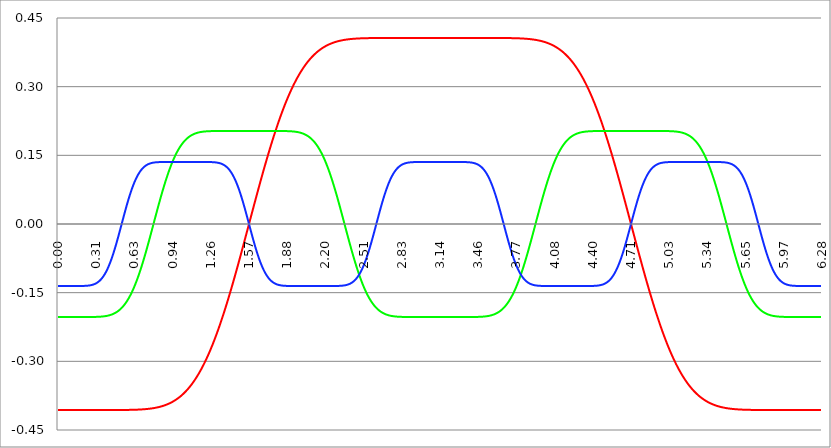
| Category | Series 1 | Series 0 | Series 2 |
|---|---|---|---|
| 0.0 | -0.406 | -0.203 | -0.135 |
| 0.00314159265358979 | -0.406 | -0.203 | -0.135 |
| 0.00628318530717958 | -0.406 | -0.203 | -0.135 |
| 0.00942477796076938 | -0.406 | -0.203 | -0.135 |
| 0.0125663706143592 | -0.406 | -0.203 | -0.135 |
| 0.015707963267949 | -0.406 | -0.203 | -0.135 |
| 0.0188495559215388 | -0.406 | -0.203 | -0.135 |
| 0.0219911485751285 | -0.406 | -0.203 | -0.135 |
| 0.0251327412287183 | -0.406 | -0.203 | -0.135 |
| 0.0282743338823081 | -0.406 | -0.203 | -0.135 |
| 0.0314159265358979 | -0.406 | -0.203 | -0.135 |
| 0.0345575191894877 | -0.406 | -0.203 | -0.135 |
| 0.0376991118430775 | -0.406 | -0.203 | -0.135 |
| 0.0408407044966673 | -0.406 | -0.203 | -0.135 |
| 0.0439822971502571 | -0.406 | -0.203 | -0.135 |
| 0.0471238898038469 | -0.406 | -0.203 | -0.135 |
| 0.0502654824574367 | -0.406 | -0.203 | -0.135 |
| 0.0534070751110265 | -0.406 | -0.203 | -0.135 |
| 0.0565486677646163 | -0.406 | -0.203 | -0.135 |
| 0.059690260418206 | -0.406 | -0.203 | -0.135 |
| 0.0628318530717958 | -0.406 | -0.203 | -0.135 |
| 0.0659734457253856 | -0.406 | -0.203 | -0.135 |
| 0.0691150383789754 | -0.406 | -0.203 | -0.135 |
| 0.0722566310325652 | -0.406 | -0.203 | -0.135 |
| 0.075398223686155 | -0.406 | -0.203 | -0.135 |
| 0.0785398163397448 | -0.406 | -0.203 | -0.135 |
| 0.0816814089933346 | -0.406 | -0.203 | -0.135 |
| 0.0848230016469244 | -0.406 | -0.203 | -0.135 |
| 0.0879645943005142 | -0.406 | -0.203 | -0.135 |
| 0.091106186954104 | -0.406 | -0.203 | -0.135 |
| 0.0942477796076937 | -0.406 | -0.203 | -0.135 |
| 0.0973893722612835 | -0.406 | -0.203 | -0.135 |
| 0.100530964914873 | -0.406 | -0.203 | -0.135 |
| 0.103672557568463 | -0.406 | -0.203 | -0.135 |
| 0.106814150222053 | -0.406 | -0.203 | -0.135 |
| 0.109955742875643 | -0.406 | -0.203 | -0.135 |
| 0.113097335529233 | -0.406 | -0.203 | -0.135 |
| 0.116238928182822 | -0.406 | -0.203 | -0.135 |
| 0.119380520836412 | -0.406 | -0.203 | -0.135 |
| 0.122522113490002 | -0.406 | -0.203 | -0.135 |
| 0.125663706143592 | -0.406 | -0.203 | -0.135 |
| 0.128805298797181 | -0.406 | -0.203 | -0.135 |
| 0.131946891450771 | -0.406 | -0.203 | -0.135 |
| 0.135088484104361 | -0.406 | -0.203 | -0.135 |
| 0.138230076757951 | -0.406 | -0.203 | -0.135 |
| 0.141371669411541 | -0.406 | -0.203 | -0.135 |
| 0.14451326206513 | -0.406 | -0.203 | -0.135 |
| 0.14765485471872 | -0.406 | -0.203 | -0.135 |
| 0.15079644737231 | -0.406 | -0.203 | -0.135 |
| 0.1539380400259 | -0.406 | -0.203 | -0.135 |
| 0.15707963267949 | -0.406 | -0.203 | -0.135 |
| 0.160221225333079 | -0.406 | -0.203 | -0.135 |
| 0.163362817986669 | -0.406 | -0.203 | -0.135 |
| 0.166504410640259 | -0.406 | -0.203 | -0.135 |
| 0.169646003293849 | -0.406 | -0.203 | -0.135 |
| 0.172787595947439 | -0.406 | -0.203 | -0.135 |
| 0.175929188601028 | -0.406 | -0.203 | -0.135 |
| 0.179070781254618 | -0.406 | -0.203 | -0.135 |
| 0.182212373908208 | -0.406 | -0.203 | -0.135 |
| 0.185353966561798 | -0.406 | -0.203 | -0.135 |
| 0.188495559215388 | -0.406 | -0.203 | -0.135 |
| 0.191637151868977 | -0.406 | -0.203 | -0.135 |
| 0.194778744522567 | -0.406 | -0.203 | -0.135 |
| 0.197920337176157 | -0.406 | -0.203 | -0.135 |
| 0.201061929829747 | -0.406 | -0.203 | -0.135 |
| 0.204203522483336 | -0.406 | -0.203 | -0.135 |
| 0.207345115136926 | -0.406 | -0.203 | -0.135 |
| 0.210486707790516 | -0.406 | -0.203 | -0.135 |
| 0.213628300444106 | -0.406 | -0.203 | -0.135 |
| 0.216769893097696 | -0.406 | -0.203 | -0.135 |
| 0.219911485751285 | -0.406 | -0.203 | -0.135 |
| 0.223053078404875 | -0.406 | -0.203 | -0.135 |
| 0.226194671058465 | -0.406 | -0.203 | -0.135 |
| 0.229336263712055 | -0.406 | -0.203 | -0.135 |
| 0.232477856365645 | -0.406 | -0.203 | -0.135 |
| 0.235619449019234 | -0.406 | -0.203 | -0.135 |
| 0.238761041672824 | -0.406 | -0.203 | -0.135 |
| 0.241902634326414 | -0.406 | -0.203 | -0.135 |
| 0.245044226980004 | -0.406 | -0.203 | -0.135 |
| 0.248185819633594 | -0.406 | -0.203 | -0.135 |
| 0.251327412287183 | -0.406 | -0.203 | -0.134 |
| 0.254469004940773 | -0.406 | -0.203 | -0.134 |
| 0.257610597594363 | -0.406 | -0.203 | -0.134 |
| 0.260752190247953 | -0.406 | -0.203 | -0.134 |
| 0.263893782901543 | -0.406 | -0.203 | -0.134 |
| 0.267035375555132 | -0.406 | -0.203 | -0.134 |
| 0.270176968208722 | -0.406 | -0.203 | -0.134 |
| 0.273318560862312 | -0.406 | -0.203 | -0.133 |
| 0.276460153515902 | -0.406 | -0.203 | -0.133 |
| 0.279601746169492 | -0.406 | -0.203 | -0.133 |
| 0.282743338823082 | -0.406 | -0.203 | -0.133 |
| 0.285884931476671 | -0.406 | -0.203 | -0.133 |
| 0.289026524130261 | -0.406 | -0.203 | -0.132 |
| 0.292168116783851 | -0.406 | -0.203 | -0.132 |
| 0.295309709437441 | -0.406 | -0.203 | -0.132 |
| 0.298451302091031 | -0.406 | -0.203 | -0.131 |
| 0.30159289474462 | -0.406 | -0.203 | -0.131 |
| 0.30473448739821 | -0.406 | -0.203 | -0.131 |
| 0.3078760800518 | -0.406 | -0.203 | -0.13 |
| 0.31101767270539 | -0.406 | -0.203 | -0.13 |
| 0.31415926535898 | -0.406 | -0.203 | -0.129 |
| 0.31730085801257 | -0.406 | -0.203 | -0.129 |
| 0.320442450666159 | -0.406 | -0.203 | -0.128 |
| 0.323584043319749 | -0.406 | -0.203 | -0.128 |
| 0.326725635973339 | -0.406 | -0.203 | -0.127 |
| 0.329867228626929 | -0.406 | -0.203 | -0.127 |
| 0.333008821280519 | -0.406 | -0.203 | -0.126 |
| 0.336150413934108 | -0.406 | -0.203 | -0.125 |
| 0.339292006587698 | -0.406 | -0.203 | -0.125 |
| 0.342433599241288 | -0.406 | -0.203 | -0.124 |
| 0.345575191894878 | -0.406 | -0.202 | -0.123 |
| 0.348716784548468 | -0.406 | -0.202 | -0.122 |
| 0.351858377202058 | -0.406 | -0.202 | -0.121 |
| 0.354999969855647 | -0.406 | -0.202 | -0.12 |
| 0.358141562509237 | -0.406 | -0.202 | -0.12 |
| 0.361283155162827 | -0.406 | -0.202 | -0.119 |
| 0.364424747816417 | -0.406 | -0.202 | -0.117 |
| 0.367566340470007 | -0.406 | -0.202 | -0.116 |
| 0.370707933123597 | -0.406 | -0.202 | -0.115 |
| 0.373849525777186 | -0.406 | -0.202 | -0.114 |
| 0.376991118430776 | -0.406 | -0.202 | -0.113 |
| 0.380132711084366 | -0.406 | -0.202 | -0.111 |
| 0.383274303737956 | -0.406 | -0.202 | -0.11 |
| 0.386415896391546 | -0.406 | -0.201 | -0.109 |
| 0.389557489045135 | -0.406 | -0.201 | -0.107 |
| 0.392699081698725 | -0.406 | -0.201 | -0.106 |
| 0.395840674352315 | -0.406 | -0.201 | -0.104 |
| 0.398982267005905 | -0.406 | -0.201 | -0.103 |
| 0.402123859659495 | -0.406 | -0.201 | -0.101 |
| 0.405265452313085 | -0.406 | -0.2 | -0.099 |
| 0.408407044966674 | -0.406 | -0.2 | -0.097 |
| 0.411548637620264 | -0.406 | -0.2 | -0.095 |
| 0.414690230273854 | -0.406 | -0.2 | -0.094 |
| 0.417831822927444 | -0.406 | -0.2 | -0.092 |
| 0.420973415581034 | -0.406 | -0.2 | -0.09 |
| 0.424115008234623 | -0.406 | -0.199 | -0.088 |
| 0.427256600888213 | -0.406 | -0.199 | -0.085 |
| 0.430398193541803 | -0.406 | -0.199 | -0.083 |
| 0.433539786195393 | -0.406 | -0.199 | -0.081 |
| 0.436681378848983 | -0.406 | -0.198 | -0.079 |
| 0.439822971502573 | -0.406 | -0.198 | -0.076 |
| 0.442964564156162 | -0.406 | -0.198 | -0.074 |
| 0.446106156809752 | -0.406 | -0.197 | -0.072 |
| 0.449247749463342 | -0.406 | -0.197 | -0.069 |
| 0.452389342116932 | -0.406 | -0.197 | -0.067 |
| 0.455530934770522 | -0.406 | -0.196 | -0.064 |
| 0.458672527424111 | -0.406 | -0.196 | -0.061 |
| 0.461814120077701 | -0.406 | -0.195 | -0.059 |
| 0.464955712731291 | -0.406 | -0.195 | -0.056 |
| 0.468097305384881 | -0.406 | -0.195 | -0.053 |
| 0.471238898038471 | -0.406 | -0.194 | -0.05 |
| 0.474380490692061 | -0.406 | -0.194 | -0.048 |
| 0.47752208334565 | -0.406 | -0.193 | -0.045 |
| 0.48066367599924 | -0.406 | -0.193 | -0.042 |
| 0.48380526865283 | -0.406 | -0.192 | -0.039 |
| 0.48694686130642 | -0.406 | -0.192 | -0.036 |
| 0.49008845396001 | -0.406 | -0.191 | -0.033 |
| 0.493230046613599 | -0.406 | -0.19 | -0.03 |
| 0.496371639267189 | -0.406 | -0.19 | -0.027 |
| 0.499513231920779 | -0.406 | -0.189 | -0.024 |
| 0.502654824574369 | -0.406 | -0.188 | -0.021 |
| 0.505796417227959 | -0.406 | -0.188 | -0.018 |
| 0.508938009881549 | -0.406 | -0.187 | -0.015 |
| 0.512079602535138 | -0.406 | -0.186 | -0.011 |
| 0.515221195188728 | -0.406 | -0.185 | -0.008 |
| 0.518362787842318 | -0.406 | -0.185 | -0.005 |
| 0.521504380495908 | -0.406 | -0.184 | -0.002 |
| 0.524645973149498 | -0.406 | -0.183 | 0.001 |
| 0.527787565803087 | -0.406 | -0.182 | 0.004 |
| 0.530929158456677 | -0.406 | -0.181 | 0.007 |
| 0.534070751110267 | -0.406 | -0.18 | 0.01 |
| 0.537212343763857 | -0.406 | -0.179 | 0.014 |
| 0.540353936417447 | -0.406 | -0.178 | 0.017 |
| 0.543495529071037 | -0.406 | -0.177 | 0.02 |
| 0.546637121724626 | -0.406 | -0.176 | 0.023 |
| 0.549778714378216 | -0.406 | -0.175 | 0.026 |
| 0.552920307031806 | -0.406 | -0.174 | 0.029 |
| 0.556061899685396 | -0.406 | -0.173 | 0.032 |
| 0.559203492338986 | -0.406 | -0.172 | 0.035 |
| 0.562345084992576 | -0.406 | -0.17 | 0.038 |
| 0.565486677646165 | -0.406 | -0.169 | 0.041 |
| 0.568628270299755 | -0.406 | -0.168 | 0.044 |
| 0.571769862953345 | -0.406 | -0.167 | 0.047 |
| 0.574911455606935 | -0.406 | -0.165 | 0.05 |
| 0.578053048260525 | -0.406 | -0.164 | 0.052 |
| 0.581194640914114 | -0.406 | -0.162 | 0.055 |
| 0.584336233567704 | -0.406 | -0.161 | 0.058 |
| 0.587477826221294 | -0.406 | -0.159 | 0.061 |
| 0.590619418874884 | -0.406 | -0.158 | 0.063 |
| 0.593761011528474 | -0.406 | -0.156 | 0.066 |
| 0.596902604182064 | -0.406 | -0.155 | 0.068 |
| 0.600044196835653 | -0.406 | -0.153 | 0.071 |
| 0.603185789489243 | -0.406 | -0.151 | 0.073 |
| 0.606327382142833 | -0.406 | -0.15 | 0.076 |
| 0.609468974796423 | -0.406 | -0.148 | 0.078 |
| 0.612610567450013 | -0.406 | -0.146 | 0.08 |
| 0.615752160103602 | -0.406 | -0.144 | 0.083 |
| 0.618893752757192 | -0.406 | -0.142 | 0.085 |
| 0.622035345410782 | -0.406 | -0.14 | 0.087 |
| 0.625176938064372 | -0.406 | -0.138 | 0.089 |
| 0.628318530717962 | -0.406 | -0.136 | 0.091 |
| 0.631460123371551 | -0.406 | -0.134 | 0.093 |
| 0.634601716025141 | -0.406 | -0.132 | 0.095 |
| 0.637743308678731 | -0.406 | -0.13 | 0.097 |
| 0.640884901332321 | -0.406 | -0.128 | 0.099 |
| 0.644026493985911 | -0.406 | -0.126 | 0.1 |
| 0.647168086639501 | -0.406 | -0.124 | 0.102 |
| 0.65030967929309 | -0.406 | -0.122 | 0.104 |
| 0.65345127194668 | -0.406 | -0.119 | 0.105 |
| 0.65659286460027 | -0.405 | -0.117 | 0.107 |
| 0.65973445725386 | -0.405 | -0.115 | 0.108 |
| 0.66287604990745 | -0.405 | -0.112 | 0.11 |
| 0.666017642561039 | -0.405 | -0.11 | 0.111 |
| 0.669159235214629 | -0.405 | -0.107 | 0.112 |
| 0.672300827868219 | -0.405 | -0.105 | 0.114 |
| 0.675442420521809 | -0.405 | -0.102 | 0.115 |
| 0.678584013175399 | -0.405 | -0.1 | 0.116 |
| 0.681725605828989 | -0.405 | -0.097 | 0.117 |
| 0.684867198482578 | -0.405 | -0.095 | 0.118 |
| 0.688008791136168 | -0.405 | -0.092 | 0.119 |
| 0.691150383789758 | -0.405 | -0.089 | 0.12 |
| 0.694291976443348 | -0.405 | -0.087 | 0.121 |
| 0.697433569096938 | -0.405 | -0.084 | 0.122 |
| 0.700575161750528 | -0.405 | -0.081 | 0.123 |
| 0.703716754404117 | -0.405 | -0.079 | 0.124 |
| 0.706858347057707 | -0.405 | -0.076 | 0.124 |
| 0.709999939711297 | -0.405 | -0.073 | 0.125 |
| 0.713141532364887 | -0.405 | -0.07 | 0.126 |
| 0.716283125018477 | -0.404 | -0.067 | 0.127 |
| 0.719424717672066 | -0.404 | -0.064 | 0.127 |
| 0.722566310325656 | -0.404 | -0.061 | 0.128 |
| 0.725707902979246 | -0.404 | -0.058 | 0.128 |
| 0.728849495632836 | -0.404 | -0.055 | 0.129 |
| 0.731991088286426 | -0.404 | -0.053 | 0.129 |
| 0.735132680940016 | -0.404 | -0.05 | 0.13 |
| 0.738274273593605 | -0.404 | -0.047 | 0.13 |
| 0.741415866247195 | -0.404 | -0.043 | 0.131 |
| 0.744557458900785 | -0.404 | -0.04 | 0.131 |
| 0.747699051554375 | -0.404 | -0.037 | 0.131 |
| 0.750840644207965 | -0.404 | -0.034 | 0.132 |
| 0.753982236861554 | -0.403 | -0.031 | 0.132 |
| 0.757123829515144 | -0.403 | -0.028 | 0.132 |
| 0.760265422168734 | -0.403 | -0.025 | 0.133 |
| 0.763407014822324 | -0.403 | -0.022 | 0.133 |
| 0.766548607475914 | -0.403 | -0.019 | 0.133 |
| 0.769690200129504 | -0.403 | -0.016 | 0.133 |
| 0.772831792783093 | -0.403 | -0.013 | 0.133 |
| 0.775973385436683 | -0.403 | -0.009 | 0.134 |
| 0.779114978090273 | -0.403 | -0.006 | 0.134 |
| 0.782256570743863 | -0.402 | -0.003 | 0.134 |
| 0.785398163397453 | -0.402 | 0 | 0.134 |
| 0.788539756051042 | -0.402 | 0.003 | 0.134 |
| 0.791681348704632 | -0.402 | 0.006 | 0.134 |
| 0.794822941358222 | -0.402 | 0.009 | 0.134 |
| 0.797964534011812 | -0.402 | 0.013 | 0.135 |
| 0.801106126665402 | -0.401 | 0.016 | 0.135 |
| 0.804247719318992 | -0.401 | 0.019 | 0.135 |
| 0.807389311972581 | -0.401 | 0.022 | 0.135 |
| 0.810530904626171 | -0.401 | 0.025 | 0.135 |
| 0.813672497279761 | -0.401 | 0.028 | 0.135 |
| 0.816814089933351 | -0.401 | 0.031 | 0.135 |
| 0.819955682586941 | -0.4 | 0.034 | 0.135 |
| 0.823097275240531 | -0.4 | 0.037 | 0.135 |
| 0.82623886789412 | -0.4 | 0.04 | 0.135 |
| 0.82938046054771 | -0.4 | 0.043 | 0.135 |
| 0.8325220532013 | -0.4 | 0.047 | 0.135 |
| 0.83566364585489 | -0.399 | 0.05 | 0.135 |
| 0.83880523850848 | -0.399 | 0.053 | 0.135 |
| 0.841946831162069 | -0.399 | 0.055 | 0.135 |
| 0.845088423815659 | -0.399 | 0.058 | 0.135 |
| 0.848230016469249 | -0.399 | 0.061 | 0.135 |
| 0.851371609122839 | -0.398 | 0.064 | 0.135 |
| 0.854513201776429 | -0.398 | 0.067 | 0.135 |
| 0.857654794430019 | -0.398 | 0.07 | 0.135 |
| 0.860796387083608 | -0.398 | 0.073 | 0.135 |
| 0.863937979737198 | -0.397 | 0.076 | 0.135 |
| 0.867079572390788 | -0.397 | 0.079 | 0.135 |
| 0.870221165044378 | -0.397 | 0.081 | 0.135 |
| 0.873362757697968 | -0.396 | 0.084 | 0.135 |
| 0.876504350351557 | -0.396 | 0.087 | 0.135 |
| 0.879645943005147 | -0.396 | 0.089 | 0.135 |
| 0.882787535658737 | -0.396 | 0.092 | 0.135 |
| 0.885929128312327 | -0.395 | 0.095 | 0.135 |
| 0.889070720965917 | -0.395 | 0.097 | 0.135 |
| 0.892212313619507 | -0.395 | 0.1 | 0.135 |
| 0.895353906273096 | -0.394 | 0.102 | 0.135 |
| 0.898495498926686 | -0.394 | 0.105 | 0.135 |
| 0.901637091580276 | -0.394 | 0.107 | 0.135 |
| 0.904778684233866 | -0.393 | 0.11 | 0.135 |
| 0.907920276887456 | -0.393 | 0.112 | 0.135 |
| 0.911061869541045 | -0.392 | 0.115 | 0.135 |
| 0.914203462194635 | -0.392 | 0.117 | 0.135 |
| 0.917345054848225 | -0.392 | 0.119 | 0.135 |
| 0.920486647501815 | -0.391 | 0.122 | 0.135 |
| 0.923628240155405 | -0.391 | 0.124 | 0.135 |
| 0.926769832808995 | -0.391 | 0.126 | 0.135 |
| 0.929911425462584 | -0.39 | 0.128 | 0.135 |
| 0.933053018116174 | -0.39 | 0.13 | 0.135 |
| 0.936194610769764 | -0.389 | 0.132 | 0.135 |
| 0.939336203423354 | -0.389 | 0.134 | 0.135 |
| 0.942477796076944 | -0.388 | 0.136 | 0.135 |
| 0.945619388730533 | -0.388 | 0.138 | 0.135 |
| 0.948760981384123 | -0.387 | 0.14 | 0.135 |
| 0.951902574037713 | -0.387 | 0.142 | 0.135 |
| 0.955044166691303 | -0.386 | 0.144 | 0.135 |
| 0.958185759344893 | -0.386 | 0.146 | 0.135 |
| 0.961327351998483 | -0.385 | 0.148 | 0.135 |
| 0.964468944652072 | -0.385 | 0.15 | 0.135 |
| 0.967610537305662 | -0.384 | 0.151 | 0.135 |
| 0.970752129959252 | -0.384 | 0.153 | 0.135 |
| 0.973893722612842 | -0.383 | 0.155 | 0.135 |
| 0.977035315266432 | -0.383 | 0.156 | 0.135 |
| 0.980176907920022 | -0.382 | 0.158 | 0.135 |
| 0.983318500573611 | -0.381 | 0.159 | 0.135 |
| 0.986460093227201 | -0.381 | 0.161 | 0.135 |
| 0.989601685880791 | -0.38 | 0.162 | 0.135 |
| 0.992743278534381 | -0.38 | 0.164 | 0.135 |
| 0.995884871187971 | -0.379 | 0.165 | 0.135 |
| 0.99902646384156 | -0.378 | 0.167 | 0.135 |
| 1.00216805649515 | -0.378 | 0.168 | 0.135 |
| 1.00530964914874 | -0.377 | 0.169 | 0.135 |
| 1.00845124180233 | -0.376 | 0.17 | 0.135 |
| 1.01159283445592 | -0.375 | 0.172 | 0.135 |
| 1.01473442710951 | -0.375 | 0.173 | 0.135 |
| 1.017876019763099 | -0.374 | 0.174 | 0.135 |
| 1.021017612416689 | -0.373 | 0.175 | 0.135 |
| 1.02415920507028 | -0.373 | 0.176 | 0.135 |
| 1.027300797723869 | -0.372 | 0.177 | 0.135 |
| 1.030442390377459 | -0.371 | 0.178 | 0.135 |
| 1.033583983031048 | -0.37 | 0.179 | 0.135 |
| 1.036725575684638 | -0.369 | 0.18 | 0.135 |
| 1.039867168338228 | -0.369 | 0.181 | 0.135 |
| 1.043008760991818 | -0.368 | 0.182 | 0.135 |
| 1.046150353645408 | -0.367 | 0.183 | 0.135 |
| 1.049291946298998 | -0.366 | 0.184 | 0.135 |
| 1.052433538952587 | -0.365 | 0.185 | 0.135 |
| 1.055575131606177 | -0.364 | 0.185 | 0.135 |
| 1.058716724259767 | -0.363 | 0.186 | 0.135 |
| 1.061858316913357 | -0.362 | 0.187 | 0.135 |
| 1.064999909566947 | -0.361 | 0.188 | 0.135 |
| 1.068141502220536 | -0.361 | 0.188 | 0.135 |
| 1.071283094874126 | -0.36 | 0.189 | 0.135 |
| 1.074424687527716 | -0.359 | 0.19 | 0.135 |
| 1.077566280181306 | -0.358 | 0.19 | 0.135 |
| 1.080707872834896 | -0.357 | 0.191 | 0.135 |
| 1.083849465488486 | -0.356 | 0.192 | 0.135 |
| 1.086991058142075 | -0.355 | 0.192 | 0.135 |
| 1.090132650795665 | -0.353 | 0.193 | 0.135 |
| 1.093274243449255 | -0.352 | 0.193 | 0.135 |
| 1.096415836102845 | -0.351 | 0.194 | 0.135 |
| 1.099557428756435 | -0.35 | 0.194 | 0.135 |
| 1.102699021410025 | -0.349 | 0.195 | 0.135 |
| 1.105840614063614 | -0.348 | 0.195 | 0.135 |
| 1.108982206717204 | -0.347 | 0.195 | 0.135 |
| 1.112123799370794 | -0.346 | 0.196 | 0.135 |
| 1.115265392024384 | -0.344 | 0.196 | 0.135 |
| 1.118406984677974 | -0.343 | 0.197 | 0.135 |
| 1.121548577331563 | -0.342 | 0.197 | 0.135 |
| 1.124690169985153 | -0.341 | 0.197 | 0.135 |
| 1.127831762638743 | -0.34 | 0.198 | 0.135 |
| 1.130973355292333 | -0.338 | 0.198 | 0.135 |
| 1.134114947945923 | -0.337 | 0.198 | 0.135 |
| 1.137256540599513 | -0.336 | 0.199 | 0.135 |
| 1.140398133253102 | -0.334 | 0.199 | 0.135 |
| 1.143539725906692 | -0.333 | 0.199 | 0.135 |
| 1.146681318560282 | -0.332 | 0.199 | 0.135 |
| 1.149822911213872 | -0.33 | 0.2 | 0.135 |
| 1.152964503867462 | -0.329 | 0.2 | 0.135 |
| 1.156106096521051 | -0.327 | 0.2 | 0.135 |
| 1.159247689174641 | -0.326 | 0.2 | 0.135 |
| 1.162389281828231 | -0.325 | 0.2 | 0.135 |
| 1.165530874481821 | -0.323 | 0.2 | 0.135 |
| 1.168672467135411 | -0.322 | 0.201 | 0.135 |
| 1.171814059789001 | -0.32 | 0.201 | 0.135 |
| 1.17495565244259 | -0.319 | 0.201 | 0.135 |
| 1.17809724509618 | -0.317 | 0.201 | 0.135 |
| 1.18123883774977 | -0.316 | 0.201 | 0.135 |
| 1.18438043040336 | -0.314 | 0.201 | 0.135 |
| 1.18752202305695 | -0.312 | 0.202 | 0.135 |
| 1.190663615710539 | -0.311 | 0.202 | 0.135 |
| 1.193805208364129 | -0.309 | 0.202 | 0.135 |
| 1.19694680101772 | -0.308 | 0.202 | 0.135 |
| 1.200088393671309 | -0.306 | 0.202 | 0.135 |
| 1.203229986324899 | -0.304 | 0.202 | 0.135 |
| 1.206371578978489 | -0.303 | 0.202 | 0.135 |
| 1.209513171632078 | -0.301 | 0.202 | 0.135 |
| 1.212654764285668 | -0.299 | 0.202 | 0.135 |
| 1.215796356939258 | -0.297 | 0.202 | 0.135 |
| 1.218937949592848 | -0.296 | 0.202 | 0.135 |
| 1.222079542246438 | -0.294 | 0.202 | 0.135 |
| 1.225221134900027 | -0.292 | 0.202 | 0.135 |
| 1.228362727553617 | -0.29 | 0.203 | 0.135 |
| 1.231504320207207 | -0.288 | 0.203 | 0.135 |
| 1.234645912860797 | -0.286 | 0.203 | 0.135 |
| 1.237787505514387 | -0.285 | 0.203 | 0.135 |
| 1.240929098167977 | -0.283 | 0.203 | 0.135 |
| 1.244070690821566 | -0.281 | 0.203 | 0.135 |
| 1.247212283475156 | -0.279 | 0.203 | 0.135 |
| 1.250353876128746 | -0.277 | 0.203 | 0.135 |
| 1.253495468782336 | -0.275 | 0.203 | 0.135 |
| 1.256637061435926 | -0.273 | 0.203 | 0.135 |
| 1.259778654089515 | -0.271 | 0.203 | 0.135 |
| 1.262920246743105 | -0.269 | 0.203 | 0.135 |
| 1.266061839396695 | -0.267 | 0.203 | 0.135 |
| 1.269203432050285 | -0.265 | 0.203 | 0.135 |
| 1.272345024703875 | -0.263 | 0.203 | 0.135 |
| 1.275486617357465 | -0.261 | 0.203 | 0.135 |
| 1.278628210011054 | -0.258 | 0.203 | 0.135 |
| 1.281769802664644 | -0.256 | 0.203 | 0.135 |
| 1.284911395318234 | -0.254 | 0.203 | 0.135 |
| 1.288052987971824 | -0.252 | 0.203 | 0.135 |
| 1.291194580625414 | -0.25 | 0.203 | 0.135 |
| 1.294336173279003 | -0.248 | 0.203 | 0.135 |
| 1.297477765932593 | -0.245 | 0.203 | 0.135 |
| 1.300619358586183 | -0.243 | 0.203 | 0.134 |
| 1.303760951239773 | -0.241 | 0.203 | 0.134 |
| 1.306902543893363 | -0.239 | 0.203 | 0.134 |
| 1.310044136546953 | -0.236 | 0.203 | 0.134 |
| 1.313185729200542 | -0.234 | 0.203 | 0.134 |
| 1.316327321854132 | -0.232 | 0.203 | 0.134 |
| 1.319468914507722 | -0.229 | 0.203 | 0.134 |
| 1.322610507161312 | -0.227 | 0.203 | 0.133 |
| 1.325752099814902 | -0.225 | 0.203 | 0.133 |
| 1.328893692468491 | -0.222 | 0.203 | 0.133 |
| 1.332035285122081 | -0.22 | 0.203 | 0.133 |
| 1.335176877775671 | -0.217 | 0.203 | 0.132 |
| 1.338318470429261 | -0.215 | 0.203 | 0.132 |
| 1.341460063082851 | -0.212 | 0.203 | 0.132 |
| 1.344601655736441 | -0.21 | 0.203 | 0.132 |
| 1.34774324839003 | -0.207 | 0.203 | 0.131 |
| 1.35088484104362 | -0.205 | 0.203 | 0.131 |
| 1.35402643369721 | -0.202 | 0.203 | 0.13 |
| 1.3571680263508 | -0.2 | 0.203 | 0.13 |
| 1.36030961900439 | -0.197 | 0.203 | 0.13 |
| 1.363451211657979 | -0.195 | 0.203 | 0.129 |
| 1.36659280431157 | -0.192 | 0.203 | 0.129 |
| 1.369734396965159 | -0.189 | 0.203 | 0.128 |
| 1.372875989618749 | -0.187 | 0.203 | 0.128 |
| 1.376017582272339 | -0.184 | 0.203 | 0.127 |
| 1.379159174925929 | -0.182 | 0.203 | 0.126 |
| 1.382300767579518 | -0.179 | 0.203 | 0.126 |
| 1.385442360233108 | -0.176 | 0.203 | 0.125 |
| 1.388583952886698 | -0.174 | 0.203 | 0.124 |
| 1.391725545540288 | -0.171 | 0.203 | 0.123 |
| 1.394867138193878 | -0.168 | 0.203 | 0.123 |
| 1.398008730847468 | -0.165 | 0.203 | 0.122 |
| 1.401150323501057 | -0.163 | 0.203 | 0.121 |
| 1.404291916154647 | -0.16 | 0.203 | 0.12 |
| 1.407433508808237 | -0.157 | 0.203 | 0.119 |
| 1.410575101461827 | -0.154 | 0.203 | 0.118 |
| 1.413716694115417 | -0.151 | 0.203 | 0.117 |
| 1.416858286769006 | -0.149 | 0.203 | 0.116 |
| 1.419999879422596 | -0.146 | 0.203 | 0.114 |
| 1.423141472076186 | -0.143 | 0.203 | 0.113 |
| 1.426283064729776 | -0.14 | 0.203 | 0.112 |
| 1.429424657383366 | -0.137 | 0.203 | 0.111 |
| 1.432566250036956 | -0.134 | 0.203 | 0.109 |
| 1.435707842690545 | -0.131 | 0.203 | 0.108 |
| 1.438849435344135 | -0.129 | 0.203 | 0.106 |
| 1.441991027997725 | -0.126 | 0.203 | 0.105 |
| 1.445132620651315 | -0.123 | 0.203 | 0.103 |
| 1.448274213304905 | -0.12 | 0.203 | 0.101 |
| 1.451415805958494 | -0.117 | 0.203 | 0.1 |
| 1.454557398612084 | -0.114 | 0.203 | 0.098 |
| 1.457698991265674 | -0.111 | 0.203 | 0.096 |
| 1.460840583919264 | -0.108 | 0.203 | 0.094 |
| 1.463982176572854 | -0.105 | 0.203 | 0.092 |
| 1.467123769226444 | -0.102 | 0.203 | 0.09 |
| 1.470265361880033 | -0.099 | 0.203 | 0.088 |
| 1.473406954533623 | -0.096 | 0.203 | 0.086 |
| 1.476548547187213 | -0.093 | 0.203 | 0.084 |
| 1.479690139840803 | -0.09 | 0.203 | 0.082 |
| 1.482831732494393 | -0.087 | 0.203 | 0.08 |
| 1.485973325147982 | -0.084 | 0.203 | 0.077 |
| 1.489114917801572 | -0.081 | 0.203 | 0.075 |
| 1.492256510455162 | -0.078 | 0.203 | 0.072 |
| 1.495398103108752 | -0.075 | 0.203 | 0.07 |
| 1.498539695762342 | -0.072 | 0.203 | 0.067 |
| 1.501681288415932 | -0.069 | 0.203 | 0.065 |
| 1.504822881069521 | -0.066 | 0.203 | 0.062 |
| 1.507964473723111 | -0.062 | 0.203 | 0.06 |
| 1.511106066376701 | -0.059 | 0.203 | 0.057 |
| 1.514247659030291 | -0.056 | 0.203 | 0.054 |
| 1.517389251683881 | -0.053 | 0.203 | 0.051 |
| 1.520530844337471 | -0.05 | 0.203 | 0.049 |
| 1.52367243699106 | -0.047 | 0.203 | 0.046 |
| 1.52681402964465 | -0.044 | 0.203 | 0.043 |
| 1.52995562229824 | -0.041 | 0.203 | 0.04 |
| 1.53309721495183 | -0.038 | 0.203 | 0.037 |
| 1.53623880760542 | -0.034 | 0.203 | 0.034 |
| 1.539380400259009 | -0.031 | 0.203 | 0.031 |
| 1.542521992912599 | -0.028 | 0.203 | 0.028 |
| 1.545663585566189 | -0.025 | 0.203 | 0.025 |
| 1.548805178219779 | -0.022 | 0.203 | 0.022 |
| 1.551946770873369 | -0.019 | 0.203 | 0.019 |
| 1.555088363526959 | -0.016 | 0.203 | 0.016 |
| 1.558229956180548 | -0.013 | 0.203 | 0.013 |
| 1.561371548834138 | -0.009 | 0.203 | 0.009 |
| 1.564513141487728 | -0.006 | 0.203 | 0.006 |
| 1.567654734141318 | -0.003 | 0.203 | 0.003 |
| 1.570796326794908 | 0 | 0.203 | 0 |
| 1.573937919448497 | 0.003 | 0.203 | -0.003 |
| 1.577079512102087 | 0.006 | 0.203 | -0.006 |
| 1.580221104755677 | 0.009 | 0.203 | -0.009 |
| 1.583362697409267 | 0.013 | 0.203 | -0.013 |
| 1.586504290062857 | 0.016 | 0.203 | -0.016 |
| 1.589645882716447 | 0.019 | 0.203 | -0.019 |
| 1.592787475370036 | 0.022 | 0.203 | -0.022 |
| 1.595929068023626 | 0.025 | 0.203 | -0.025 |
| 1.599070660677216 | 0.028 | 0.203 | -0.028 |
| 1.602212253330806 | 0.031 | 0.203 | -0.031 |
| 1.605353845984396 | 0.034 | 0.203 | -0.034 |
| 1.608495438637985 | 0.038 | 0.203 | -0.037 |
| 1.611637031291575 | 0.041 | 0.203 | -0.04 |
| 1.614778623945165 | 0.044 | 0.203 | -0.043 |
| 1.617920216598755 | 0.047 | 0.203 | -0.046 |
| 1.621061809252345 | 0.05 | 0.203 | -0.049 |
| 1.624203401905935 | 0.053 | 0.203 | -0.051 |
| 1.627344994559524 | 0.056 | 0.203 | -0.054 |
| 1.630486587213114 | 0.059 | 0.203 | -0.057 |
| 1.633628179866704 | 0.062 | 0.203 | -0.06 |
| 1.636769772520294 | 0.066 | 0.203 | -0.062 |
| 1.639911365173884 | 0.069 | 0.203 | -0.065 |
| 1.643052957827473 | 0.072 | 0.203 | -0.067 |
| 1.646194550481063 | 0.075 | 0.203 | -0.07 |
| 1.649336143134653 | 0.078 | 0.203 | -0.072 |
| 1.652477735788243 | 0.081 | 0.203 | -0.075 |
| 1.655619328441833 | 0.084 | 0.203 | -0.077 |
| 1.658760921095423 | 0.087 | 0.203 | -0.08 |
| 1.661902513749012 | 0.09 | 0.203 | -0.082 |
| 1.665044106402602 | 0.093 | 0.203 | -0.084 |
| 1.668185699056192 | 0.096 | 0.203 | -0.086 |
| 1.671327291709782 | 0.099 | 0.203 | -0.088 |
| 1.674468884363372 | 0.102 | 0.203 | -0.09 |
| 1.677610477016961 | 0.105 | 0.203 | -0.092 |
| 1.680752069670551 | 0.108 | 0.203 | -0.094 |
| 1.683893662324141 | 0.111 | 0.203 | -0.096 |
| 1.687035254977731 | 0.114 | 0.203 | -0.098 |
| 1.690176847631321 | 0.117 | 0.203 | -0.1 |
| 1.693318440284911 | 0.12 | 0.203 | -0.101 |
| 1.6964600329385 | 0.123 | 0.203 | -0.103 |
| 1.69960162559209 | 0.126 | 0.203 | -0.105 |
| 1.70274321824568 | 0.129 | 0.203 | -0.106 |
| 1.70588481089927 | 0.131 | 0.203 | -0.108 |
| 1.70902640355286 | 0.134 | 0.203 | -0.109 |
| 1.712167996206449 | 0.137 | 0.203 | -0.111 |
| 1.715309588860039 | 0.14 | 0.203 | -0.112 |
| 1.71845118151363 | 0.143 | 0.203 | -0.113 |
| 1.721592774167219 | 0.146 | 0.203 | -0.114 |
| 1.724734366820809 | 0.149 | 0.203 | -0.116 |
| 1.727875959474399 | 0.151 | 0.203 | -0.117 |
| 1.731017552127988 | 0.154 | 0.203 | -0.118 |
| 1.734159144781578 | 0.157 | 0.203 | -0.119 |
| 1.737300737435168 | 0.16 | 0.203 | -0.12 |
| 1.740442330088758 | 0.163 | 0.203 | -0.121 |
| 1.743583922742348 | 0.165 | 0.203 | -0.122 |
| 1.746725515395937 | 0.168 | 0.203 | -0.123 |
| 1.749867108049527 | 0.171 | 0.203 | -0.123 |
| 1.753008700703117 | 0.174 | 0.203 | -0.124 |
| 1.756150293356707 | 0.176 | 0.203 | -0.125 |
| 1.759291886010297 | 0.179 | 0.203 | -0.126 |
| 1.762433478663887 | 0.182 | 0.203 | -0.126 |
| 1.765575071317476 | 0.184 | 0.203 | -0.127 |
| 1.768716663971066 | 0.187 | 0.203 | -0.128 |
| 1.771858256624656 | 0.189 | 0.203 | -0.128 |
| 1.774999849278246 | 0.192 | 0.203 | -0.129 |
| 1.778141441931836 | 0.195 | 0.203 | -0.129 |
| 1.781283034585426 | 0.197 | 0.203 | -0.13 |
| 1.784424627239015 | 0.2 | 0.203 | -0.13 |
| 1.787566219892605 | 0.202 | 0.203 | -0.13 |
| 1.790707812546195 | 0.205 | 0.203 | -0.131 |
| 1.793849405199785 | 0.207 | 0.203 | -0.131 |
| 1.796990997853375 | 0.21 | 0.203 | -0.132 |
| 1.800132590506964 | 0.212 | 0.203 | -0.132 |
| 1.803274183160554 | 0.215 | 0.203 | -0.132 |
| 1.806415775814144 | 0.217 | 0.203 | -0.132 |
| 1.809557368467734 | 0.22 | 0.203 | -0.133 |
| 1.812698961121324 | 0.222 | 0.203 | -0.133 |
| 1.815840553774914 | 0.225 | 0.203 | -0.133 |
| 1.818982146428503 | 0.227 | 0.203 | -0.133 |
| 1.822123739082093 | 0.229 | 0.203 | -0.134 |
| 1.825265331735683 | 0.232 | 0.203 | -0.134 |
| 1.828406924389273 | 0.234 | 0.203 | -0.134 |
| 1.831548517042863 | 0.236 | 0.203 | -0.134 |
| 1.834690109696452 | 0.239 | 0.203 | -0.134 |
| 1.837831702350042 | 0.241 | 0.203 | -0.134 |
| 1.840973295003632 | 0.243 | 0.203 | -0.134 |
| 1.844114887657222 | 0.245 | 0.203 | -0.135 |
| 1.847256480310812 | 0.248 | 0.203 | -0.135 |
| 1.850398072964402 | 0.25 | 0.203 | -0.135 |
| 1.853539665617991 | 0.252 | 0.203 | -0.135 |
| 1.856681258271581 | 0.254 | 0.203 | -0.135 |
| 1.859822850925171 | 0.256 | 0.203 | -0.135 |
| 1.862964443578761 | 0.258 | 0.203 | -0.135 |
| 1.866106036232351 | 0.261 | 0.203 | -0.135 |
| 1.86924762888594 | 0.263 | 0.203 | -0.135 |
| 1.87238922153953 | 0.265 | 0.203 | -0.135 |
| 1.87553081419312 | 0.267 | 0.203 | -0.135 |
| 1.87867240684671 | 0.269 | 0.203 | -0.135 |
| 1.8818139995003 | 0.271 | 0.203 | -0.135 |
| 1.88495559215389 | 0.273 | 0.203 | -0.135 |
| 1.888097184807479 | 0.275 | 0.203 | -0.135 |
| 1.891238777461069 | 0.277 | 0.203 | -0.135 |
| 1.89438037011466 | 0.279 | 0.203 | -0.135 |
| 1.897521962768249 | 0.281 | 0.203 | -0.135 |
| 1.900663555421839 | 0.283 | 0.203 | -0.135 |
| 1.903805148075429 | 0.285 | 0.203 | -0.135 |
| 1.906946740729018 | 0.286 | 0.203 | -0.135 |
| 1.910088333382608 | 0.288 | 0.203 | -0.135 |
| 1.913229926036198 | 0.29 | 0.203 | -0.135 |
| 1.916371518689788 | 0.292 | 0.202 | -0.135 |
| 1.919513111343378 | 0.294 | 0.202 | -0.135 |
| 1.922654703996967 | 0.296 | 0.202 | -0.135 |
| 1.925796296650557 | 0.297 | 0.202 | -0.135 |
| 1.928937889304147 | 0.299 | 0.202 | -0.135 |
| 1.932079481957737 | 0.301 | 0.202 | -0.135 |
| 1.935221074611327 | 0.303 | 0.202 | -0.135 |
| 1.938362667264917 | 0.304 | 0.202 | -0.135 |
| 1.941504259918506 | 0.306 | 0.202 | -0.135 |
| 1.944645852572096 | 0.308 | 0.202 | -0.135 |
| 1.947787445225686 | 0.309 | 0.202 | -0.135 |
| 1.950929037879276 | 0.311 | 0.202 | -0.135 |
| 1.954070630532866 | 0.312 | 0.202 | -0.135 |
| 1.957212223186455 | 0.314 | 0.201 | -0.135 |
| 1.960353815840045 | 0.316 | 0.201 | -0.135 |
| 1.963495408493635 | 0.317 | 0.201 | -0.135 |
| 1.966637001147225 | 0.319 | 0.201 | -0.135 |
| 1.969778593800815 | 0.32 | 0.201 | -0.135 |
| 1.972920186454405 | 0.322 | 0.201 | -0.135 |
| 1.976061779107994 | 0.323 | 0.2 | -0.135 |
| 1.979203371761584 | 0.325 | 0.2 | -0.135 |
| 1.982344964415174 | 0.326 | 0.2 | -0.135 |
| 1.985486557068764 | 0.327 | 0.2 | -0.135 |
| 1.988628149722354 | 0.329 | 0.2 | -0.135 |
| 1.991769742375943 | 0.33 | 0.2 | -0.135 |
| 1.994911335029533 | 0.332 | 0.199 | -0.135 |
| 1.998052927683123 | 0.333 | 0.199 | -0.135 |
| 2.001194520336712 | 0.334 | 0.199 | -0.135 |
| 2.004336112990302 | 0.336 | 0.199 | -0.135 |
| 2.007477705643892 | 0.337 | 0.198 | -0.135 |
| 2.010619298297482 | 0.338 | 0.198 | -0.135 |
| 2.013760890951071 | 0.34 | 0.198 | -0.135 |
| 2.016902483604661 | 0.341 | 0.197 | -0.135 |
| 2.02004407625825 | 0.342 | 0.197 | -0.135 |
| 2.02318566891184 | 0.343 | 0.197 | -0.135 |
| 2.02632726156543 | 0.344 | 0.196 | -0.135 |
| 2.029468854219019 | 0.346 | 0.196 | -0.135 |
| 2.032610446872609 | 0.347 | 0.195 | -0.135 |
| 2.035752039526198 | 0.348 | 0.195 | -0.135 |
| 2.038893632179788 | 0.349 | 0.195 | -0.135 |
| 2.042035224833378 | 0.35 | 0.194 | -0.135 |
| 2.045176817486967 | 0.351 | 0.194 | -0.135 |
| 2.048318410140557 | 0.352 | 0.193 | -0.135 |
| 2.051460002794146 | 0.353 | 0.193 | -0.135 |
| 2.054601595447736 | 0.355 | 0.192 | -0.135 |
| 2.057743188101325 | 0.356 | 0.192 | -0.135 |
| 2.060884780754915 | 0.357 | 0.191 | -0.135 |
| 2.064026373408505 | 0.358 | 0.19 | -0.135 |
| 2.067167966062094 | 0.359 | 0.19 | -0.135 |
| 2.070309558715684 | 0.36 | 0.189 | -0.135 |
| 2.073451151369273 | 0.361 | 0.188 | -0.135 |
| 2.076592744022863 | 0.361 | 0.188 | -0.135 |
| 2.079734336676452 | 0.362 | 0.187 | -0.135 |
| 2.082875929330042 | 0.363 | 0.186 | -0.135 |
| 2.086017521983632 | 0.364 | 0.185 | -0.135 |
| 2.089159114637221 | 0.365 | 0.185 | -0.135 |
| 2.092300707290811 | 0.366 | 0.184 | -0.135 |
| 2.095442299944401 | 0.367 | 0.183 | -0.135 |
| 2.09858389259799 | 0.368 | 0.182 | -0.135 |
| 2.10172548525158 | 0.369 | 0.181 | -0.135 |
| 2.104867077905169 | 0.369 | 0.18 | -0.135 |
| 2.108008670558759 | 0.37 | 0.179 | -0.135 |
| 2.111150263212349 | 0.371 | 0.178 | -0.135 |
| 2.114291855865938 | 0.372 | 0.177 | -0.135 |
| 2.117433448519528 | 0.373 | 0.176 | -0.135 |
| 2.120575041173117 | 0.373 | 0.175 | -0.135 |
| 2.123716633826707 | 0.374 | 0.174 | -0.135 |
| 2.126858226480297 | 0.375 | 0.173 | -0.135 |
| 2.129999819133886 | 0.375 | 0.172 | -0.135 |
| 2.133141411787476 | 0.376 | 0.17 | -0.135 |
| 2.136283004441065 | 0.377 | 0.169 | -0.135 |
| 2.139424597094655 | 0.378 | 0.168 | -0.135 |
| 2.142566189748245 | 0.378 | 0.167 | -0.135 |
| 2.145707782401834 | 0.379 | 0.165 | -0.135 |
| 2.148849375055424 | 0.38 | 0.164 | -0.135 |
| 2.151990967709013 | 0.38 | 0.162 | -0.135 |
| 2.155132560362603 | 0.381 | 0.161 | -0.135 |
| 2.158274153016193 | 0.381 | 0.159 | -0.135 |
| 2.161415745669782 | 0.382 | 0.158 | -0.135 |
| 2.164557338323372 | 0.383 | 0.156 | -0.135 |
| 2.167698930976961 | 0.383 | 0.155 | -0.135 |
| 2.170840523630551 | 0.384 | 0.153 | -0.135 |
| 2.173982116284141 | 0.384 | 0.151 | -0.135 |
| 2.17712370893773 | 0.385 | 0.15 | -0.135 |
| 2.18026530159132 | 0.385 | 0.148 | -0.135 |
| 2.183406894244909 | 0.386 | 0.146 | -0.135 |
| 2.186548486898499 | 0.386 | 0.144 | -0.135 |
| 2.189690079552089 | 0.387 | 0.142 | -0.135 |
| 2.192831672205678 | 0.387 | 0.14 | -0.135 |
| 2.195973264859268 | 0.388 | 0.138 | -0.135 |
| 2.199114857512857 | 0.388 | 0.136 | -0.135 |
| 2.202256450166447 | 0.389 | 0.134 | -0.135 |
| 2.205398042820036 | 0.389 | 0.132 | -0.135 |
| 2.208539635473626 | 0.39 | 0.13 | -0.135 |
| 2.211681228127216 | 0.39 | 0.128 | -0.135 |
| 2.214822820780805 | 0.391 | 0.126 | -0.135 |
| 2.217964413434395 | 0.391 | 0.124 | -0.135 |
| 2.221106006087984 | 0.391 | 0.122 | -0.135 |
| 2.224247598741574 | 0.392 | 0.119 | -0.135 |
| 2.227389191395164 | 0.392 | 0.117 | -0.135 |
| 2.230530784048753 | 0.392 | 0.115 | -0.135 |
| 2.233672376702343 | 0.393 | 0.112 | -0.135 |
| 2.236813969355933 | 0.393 | 0.11 | -0.135 |
| 2.239955562009522 | 0.394 | 0.107 | -0.135 |
| 2.243097154663112 | 0.394 | 0.105 | -0.135 |
| 2.246238747316701 | 0.394 | 0.102 | -0.135 |
| 2.249380339970291 | 0.395 | 0.1 | -0.135 |
| 2.252521932623881 | 0.395 | 0.097 | -0.135 |
| 2.25566352527747 | 0.395 | 0.095 | -0.135 |
| 2.25880511793106 | 0.396 | 0.092 | -0.135 |
| 2.261946710584649 | 0.396 | 0.089 | -0.135 |
| 2.265088303238239 | 0.396 | 0.087 | -0.135 |
| 2.268229895891829 | 0.396 | 0.084 | -0.135 |
| 2.271371488545418 | 0.397 | 0.081 | -0.135 |
| 2.274513081199008 | 0.397 | 0.079 | -0.135 |
| 2.277654673852597 | 0.397 | 0.076 | -0.135 |
| 2.280796266506186 | 0.398 | 0.073 | -0.135 |
| 2.283937859159776 | 0.398 | 0.07 | -0.135 |
| 2.287079451813366 | 0.398 | 0.067 | -0.135 |
| 2.290221044466955 | 0.398 | 0.064 | -0.135 |
| 2.293362637120545 | 0.399 | 0.061 | -0.135 |
| 2.296504229774135 | 0.399 | 0.058 | -0.135 |
| 2.299645822427724 | 0.399 | 0.055 | -0.135 |
| 2.302787415081314 | 0.399 | 0.053 | -0.135 |
| 2.305929007734904 | 0.399 | 0.05 | -0.135 |
| 2.309070600388493 | 0.4 | 0.047 | -0.135 |
| 2.312212193042083 | 0.4 | 0.043 | -0.135 |
| 2.315353785695672 | 0.4 | 0.04 | -0.135 |
| 2.318495378349262 | 0.4 | 0.037 | -0.135 |
| 2.321636971002852 | 0.4 | 0.034 | -0.135 |
| 2.324778563656441 | 0.401 | 0.031 | -0.135 |
| 2.327920156310031 | 0.401 | 0.028 | -0.135 |
| 2.33106174896362 | 0.401 | 0.025 | -0.135 |
| 2.33420334161721 | 0.401 | 0.022 | -0.135 |
| 2.3373449342708 | 0.401 | 0.019 | -0.135 |
| 2.340486526924389 | 0.401 | 0.016 | -0.135 |
| 2.343628119577979 | 0.402 | 0.013 | -0.135 |
| 2.346769712231568 | 0.402 | 0.009 | -0.134 |
| 2.349911304885158 | 0.402 | 0.006 | -0.134 |
| 2.353052897538748 | 0.402 | 0.003 | -0.134 |
| 2.356194490192337 | 0.402 | 0 | -0.134 |
| 2.359336082845927 | 0.402 | -0.003 | -0.134 |
| 2.362477675499516 | 0.403 | -0.006 | -0.134 |
| 2.365619268153106 | 0.403 | -0.009 | -0.134 |
| 2.368760860806696 | 0.403 | -0.013 | -0.133 |
| 2.371902453460285 | 0.403 | -0.016 | -0.133 |
| 2.375044046113875 | 0.403 | -0.019 | -0.133 |
| 2.378185638767464 | 0.403 | -0.022 | -0.133 |
| 2.381327231421054 | 0.403 | -0.025 | -0.133 |
| 2.384468824074644 | 0.403 | -0.028 | -0.132 |
| 2.387610416728233 | 0.403 | -0.031 | -0.132 |
| 2.390752009381823 | 0.404 | -0.034 | -0.132 |
| 2.393893602035412 | 0.404 | -0.037 | -0.131 |
| 2.397035194689002 | 0.404 | -0.04 | -0.131 |
| 2.400176787342591 | 0.404 | -0.043 | -0.131 |
| 2.403318379996181 | 0.404 | -0.047 | -0.13 |
| 2.406459972649771 | 0.404 | -0.05 | -0.13 |
| 2.40960156530336 | 0.404 | -0.053 | -0.129 |
| 2.41274315795695 | 0.404 | -0.055 | -0.129 |
| 2.41588475061054 | 0.404 | -0.058 | -0.128 |
| 2.419026343264129 | 0.404 | -0.061 | -0.128 |
| 2.422167935917719 | 0.404 | -0.064 | -0.127 |
| 2.425309528571308 | 0.404 | -0.067 | -0.127 |
| 2.428451121224898 | 0.405 | -0.07 | -0.126 |
| 2.431592713878488 | 0.405 | -0.073 | -0.125 |
| 2.434734306532077 | 0.405 | -0.076 | -0.124 |
| 2.437875899185667 | 0.405 | -0.079 | -0.124 |
| 2.441017491839256 | 0.405 | -0.081 | -0.123 |
| 2.444159084492846 | 0.405 | -0.084 | -0.122 |
| 2.447300677146435 | 0.405 | -0.087 | -0.121 |
| 2.450442269800025 | 0.405 | -0.089 | -0.12 |
| 2.453583862453615 | 0.405 | -0.092 | -0.119 |
| 2.456725455107204 | 0.405 | -0.095 | -0.118 |
| 2.459867047760794 | 0.405 | -0.097 | -0.117 |
| 2.463008640414384 | 0.405 | -0.1 | -0.116 |
| 2.466150233067973 | 0.405 | -0.102 | -0.115 |
| 2.469291825721563 | 0.405 | -0.105 | -0.114 |
| 2.472433418375152 | 0.405 | -0.107 | -0.112 |
| 2.475575011028742 | 0.405 | -0.11 | -0.111 |
| 2.478716603682332 | 0.405 | -0.112 | -0.11 |
| 2.481858196335921 | 0.405 | -0.115 | -0.108 |
| 2.48499978898951 | 0.405 | -0.117 | -0.107 |
| 2.4881413816431 | 0.406 | -0.119 | -0.105 |
| 2.49128297429669 | 0.406 | -0.122 | -0.104 |
| 2.49442456695028 | 0.406 | -0.124 | -0.102 |
| 2.497566159603869 | 0.406 | -0.126 | -0.1 |
| 2.500707752257458 | 0.406 | -0.128 | -0.099 |
| 2.503849344911048 | 0.406 | -0.13 | -0.097 |
| 2.506990937564638 | 0.406 | -0.132 | -0.095 |
| 2.510132530218228 | 0.406 | -0.134 | -0.093 |
| 2.513274122871817 | 0.406 | -0.136 | -0.091 |
| 2.516415715525407 | 0.406 | -0.138 | -0.089 |
| 2.519557308178996 | 0.406 | -0.14 | -0.087 |
| 2.522698900832586 | 0.406 | -0.142 | -0.085 |
| 2.525840493486176 | 0.406 | -0.144 | -0.083 |
| 2.528982086139765 | 0.406 | -0.146 | -0.08 |
| 2.532123678793355 | 0.406 | -0.148 | -0.078 |
| 2.535265271446944 | 0.406 | -0.15 | -0.076 |
| 2.538406864100534 | 0.406 | -0.151 | -0.073 |
| 2.541548456754124 | 0.406 | -0.153 | -0.071 |
| 2.544690049407713 | 0.406 | -0.155 | -0.068 |
| 2.547831642061302 | 0.406 | -0.156 | -0.066 |
| 2.550973234714892 | 0.406 | -0.158 | -0.063 |
| 2.554114827368482 | 0.406 | -0.159 | -0.061 |
| 2.557256420022072 | 0.406 | -0.161 | -0.058 |
| 2.560398012675661 | 0.406 | -0.162 | -0.055 |
| 2.563539605329251 | 0.406 | -0.164 | -0.052 |
| 2.56668119798284 | 0.406 | -0.165 | -0.05 |
| 2.56982279063643 | 0.406 | -0.167 | -0.047 |
| 2.57296438329002 | 0.406 | -0.168 | -0.044 |
| 2.576105975943609 | 0.406 | -0.169 | -0.041 |
| 2.579247568597199 | 0.406 | -0.17 | -0.038 |
| 2.582389161250788 | 0.406 | -0.172 | -0.035 |
| 2.585530753904377 | 0.406 | -0.173 | -0.032 |
| 2.588672346557967 | 0.406 | -0.174 | -0.029 |
| 2.591813939211557 | 0.406 | -0.175 | -0.026 |
| 2.594955531865147 | 0.406 | -0.176 | -0.023 |
| 2.598097124518736 | 0.406 | -0.177 | -0.02 |
| 2.601238717172326 | 0.406 | -0.178 | -0.017 |
| 2.604380309825915 | 0.406 | -0.179 | -0.014 |
| 2.607521902479505 | 0.406 | -0.18 | -0.01 |
| 2.610663495133095 | 0.406 | -0.181 | -0.007 |
| 2.613805087786684 | 0.406 | -0.182 | -0.004 |
| 2.616946680440274 | 0.406 | -0.183 | -0.001 |
| 2.620088273093863 | 0.406 | -0.184 | 0.002 |
| 2.623229865747452 | 0.406 | -0.185 | 0.005 |
| 2.626371458401042 | 0.406 | -0.185 | 0.008 |
| 2.629513051054632 | 0.406 | -0.186 | 0.011 |
| 2.632654643708222 | 0.406 | -0.187 | 0.015 |
| 2.635796236361811 | 0.406 | -0.188 | 0.018 |
| 2.638937829015401 | 0.406 | -0.188 | 0.021 |
| 2.642079421668991 | 0.406 | -0.189 | 0.024 |
| 2.64522101432258 | 0.406 | -0.19 | 0.027 |
| 2.64836260697617 | 0.406 | -0.19 | 0.03 |
| 2.651504199629759 | 0.406 | -0.191 | 0.033 |
| 2.654645792283349 | 0.406 | -0.192 | 0.036 |
| 2.657787384936938 | 0.406 | -0.192 | 0.039 |
| 2.660928977590528 | 0.406 | -0.193 | 0.042 |
| 2.664070570244118 | 0.406 | -0.193 | 0.045 |
| 2.667212162897707 | 0.406 | -0.194 | 0.048 |
| 2.670353755551297 | 0.406 | -0.194 | 0.05 |
| 2.673495348204887 | 0.406 | -0.195 | 0.053 |
| 2.676636940858476 | 0.406 | -0.195 | 0.056 |
| 2.679778533512066 | 0.406 | -0.195 | 0.059 |
| 2.682920126165655 | 0.406 | -0.196 | 0.061 |
| 2.686061718819245 | 0.406 | -0.196 | 0.064 |
| 2.689203311472835 | 0.406 | -0.197 | 0.067 |
| 2.692344904126424 | 0.406 | -0.197 | 0.069 |
| 2.695486496780014 | 0.406 | -0.197 | 0.072 |
| 2.698628089433603 | 0.406 | -0.198 | 0.074 |
| 2.701769682087193 | 0.406 | -0.198 | 0.076 |
| 2.704911274740782 | 0.406 | -0.198 | 0.079 |
| 2.708052867394372 | 0.406 | -0.199 | 0.081 |
| 2.711194460047962 | 0.406 | -0.199 | 0.083 |
| 2.714336052701551 | 0.406 | -0.199 | 0.085 |
| 2.717477645355141 | 0.406 | -0.199 | 0.088 |
| 2.720619238008731 | 0.406 | -0.2 | 0.09 |
| 2.72376083066232 | 0.406 | -0.2 | 0.092 |
| 2.72690242331591 | 0.406 | -0.2 | 0.094 |
| 2.730044015969499 | 0.406 | -0.2 | 0.095 |
| 2.733185608623089 | 0.406 | -0.2 | 0.097 |
| 2.736327201276678 | 0.406 | -0.2 | 0.099 |
| 2.739468793930268 | 0.406 | -0.201 | 0.101 |
| 2.742610386583858 | 0.406 | -0.201 | 0.103 |
| 2.745751979237447 | 0.406 | -0.201 | 0.104 |
| 2.748893571891036 | 0.406 | -0.201 | 0.106 |
| 2.752035164544627 | 0.406 | -0.201 | 0.107 |
| 2.755176757198216 | 0.406 | -0.201 | 0.109 |
| 2.758318349851806 | 0.406 | -0.202 | 0.11 |
| 2.761459942505395 | 0.406 | -0.202 | 0.111 |
| 2.764601535158985 | 0.406 | -0.202 | 0.113 |
| 2.767743127812574 | 0.406 | -0.202 | 0.114 |
| 2.770884720466164 | 0.406 | -0.202 | 0.115 |
| 2.774026313119754 | 0.406 | -0.202 | 0.116 |
| 2.777167905773343 | 0.406 | -0.202 | 0.117 |
| 2.780309498426932 | 0.406 | -0.202 | 0.119 |
| 2.783451091080522 | 0.406 | -0.202 | 0.12 |
| 2.786592683734112 | 0.406 | -0.202 | 0.12 |
| 2.789734276387701 | 0.406 | -0.202 | 0.121 |
| 2.792875869041291 | 0.406 | -0.202 | 0.122 |
| 2.796017461694881 | 0.406 | -0.202 | 0.123 |
| 2.79915905434847 | 0.406 | -0.203 | 0.124 |
| 2.80230064700206 | 0.406 | -0.203 | 0.125 |
| 2.80544223965565 | 0.406 | -0.203 | 0.125 |
| 2.808583832309239 | 0.406 | -0.203 | 0.126 |
| 2.811725424962829 | 0.406 | -0.203 | 0.127 |
| 2.814867017616419 | 0.406 | -0.203 | 0.127 |
| 2.818008610270008 | 0.406 | -0.203 | 0.128 |
| 2.821150202923598 | 0.406 | -0.203 | 0.128 |
| 2.824291795577187 | 0.406 | -0.203 | 0.129 |
| 2.827433388230777 | 0.406 | -0.203 | 0.129 |
| 2.830574980884366 | 0.406 | -0.203 | 0.13 |
| 2.833716573537956 | 0.406 | -0.203 | 0.13 |
| 2.836858166191546 | 0.406 | -0.203 | 0.131 |
| 2.839999758845135 | 0.406 | -0.203 | 0.131 |
| 2.843141351498725 | 0.406 | -0.203 | 0.131 |
| 2.846282944152314 | 0.406 | -0.203 | 0.132 |
| 2.849424536805904 | 0.406 | -0.203 | 0.132 |
| 2.852566129459494 | 0.406 | -0.203 | 0.132 |
| 2.855707722113083 | 0.406 | -0.203 | 0.133 |
| 2.858849314766673 | 0.406 | -0.203 | 0.133 |
| 2.861990907420262 | 0.406 | -0.203 | 0.133 |
| 2.865132500073852 | 0.406 | -0.203 | 0.133 |
| 2.868274092727442 | 0.406 | -0.203 | 0.133 |
| 2.871415685381031 | 0.406 | -0.203 | 0.134 |
| 2.874557278034621 | 0.406 | -0.203 | 0.134 |
| 2.87769887068821 | 0.406 | -0.203 | 0.134 |
| 2.8808404633418 | 0.406 | -0.203 | 0.134 |
| 2.88398205599539 | 0.406 | -0.203 | 0.134 |
| 2.88712364864898 | 0.406 | -0.203 | 0.134 |
| 2.890265241302569 | 0.406 | -0.203 | 0.134 |
| 2.893406833956158 | 0.406 | -0.203 | 0.135 |
| 2.896548426609748 | 0.406 | -0.203 | 0.135 |
| 2.899690019263338 | 0.406 | -0.203 | 0.135 |
| 2.902831611916927 | 0.406 | -0.203 | 0.135 |
| 2.905973204570517 | 0.406 | -0.203 | 0.135 |
| 2.909114797224106 | 0.406 | -0.203 | 0.135 |
| 2.912256389877696 | 0.406 | -0.203 | 0.135 |
| 2.915397982531286 | 0.406 | -0.203 | 0.135 |
| 2.918539575184875 | 0.406 | -0.203 | 0.135 |
| 2.921681167838465 | 0.406 | -0.203 | 0.135 |
| 2.924822760492054 | 0.406 | -0.203 | 0.135 |
| 2.927964353145644 | 0.406 | -0.203 | 0.135 |
| 2.931105945799234 | 0.406 | -0.203 | 0.135 |
| 2.934247538452823 | 0.406 | -0.203 | 0.135 |
| 2.937389131106413 | 0.406 | -0.203 | 0.135 |
| 2.940530723760002 | 0.406 | -0.203 | 0.135 |
| 2.943672316413592 | 0.406 | -0.203 | 0.135 |
| 2.946813909067182 | 0.406 | -0.203 | 0.135 |
| 2.949955501720771 | 0.406 | -0.203 | 0.135 |
| 2.953097094374361 | 0.406 | -0.203 | 0.135 |
| 2.95623868702795 | 0.406 | -0.203 | 0.135 |
| 2.95938027968154 | 0.406 | -0.203 | 0.135 |
| 2.96252187233513 | 0.406 | -0.203 | 0.135 |
| 2.965663464988719 | 0.406 | -0.203 | 0.135 |
| 2.968805057642309 | 0.406 | -0.203 | 0.135 |
| 2.971946650295898 | 0.406 | -0.203 | 0.135 |
| 2.975088242949488 | 0.406 | -0.203 | 0.135 |
| 2.978229835603078 | 0.406 | -0.203 | 0.135 |
| 2.981371428256667 | 0.406 | -0.203 | 0.135 |
| 2.984513020910257 | 0.406 | -0.203 | 0.135 |
| 2.987654613563846 | 0.406 | -0.203 | 0.135 |
| 2.990796206217436 | 0.406 | -0.203 | 0.135 |
| 2.993937798871025 | 0.406 | -0.203 | 0.135 |
| 2.997079391524615 | 0.406 | -0.203 | 0.135 |
| 3.000220984178205 | 0.406 | -0.203 | 0.135 |
| 3.003362576831794 | 0.406 | -0.203 | 0.135 |
| 3.006504169485384 | 0.406 | -0.203 | 0.135 |
| 3.009645762138974 | 0.406 | -0.203 | 0.135 |
| 3.012787354792563 | 0.406 | -0.203 | 0.135 |
| 3.015928947446153 | 0.406 | -0.203 | 0.135 |
| 3.019070540099742 | 0.406 | -0.203 | 0.135 |
| 3.022212132753332 | 0.406 | -0.203 | 0.135 |
| 3.025353725406922 | 0.406 | -0.203 | 0.135 |
| 3.028495318060511 | 0.406 | -0.203 | 0.135 |
| 3.031636910714101 | 0.406 | -0.203 | 0.135 |
| 3.03477850336769 | 0.406 | -0.203 | 0.135 |
| 3.03792009602128 | 0.406 | -0.203 | 0.135 |
| 3.04106168867487 | 0.406 | -0.203 | 0.135 |
| 3.04420328132846 | 0.406 | -0.203 | 0.135 |
| 3.047344873982049 | 0.406 | -0.203 | 0.135 |
| 3.050486466635638 | 0.406 | -0.203 | 0.135 |
| 3.053628059289228 | 0.406 | -0.203 | 0.135 |
| 3.056769651942818 | 0.406 | -0.203 | 0.135 |
| 3.059911244596407 | 0.406 | -0.203 | 0.135 |
| 3.063052837249997 | 0.406 | -0.203 | 0.135 |
| 3.066194429903586 | 0.406 | -0.203 | 0.135 |
| 3.069336022557176 | 0.406 | -0.203 | 0.135 |
| 3.072477615210766 | 0.406 | -0.203 | 0.135 |
| 3.075619207864355 | 0.406 | -0.203 | 0.135 |
| 3.078760800517945 | 0.406 | -0.203 | 0.135 |
| 3.081902393171534 | 0.406 | -0.203 | 0.135 |
| 3.085043985825124 | 0.406 | -0.203 | 0.135 |
| 3.088185578478713 | 0.406 | -0.203 | 0.135 |
| 3.091327171132303 | 0.406 | -0.203 | 0.135 |
| 3.094468763785893 | 0.406 | -0.203 | 0.135 |
| 3.097610356439482 | 0.406 | -0.203 | 0.135 |
| 3.100751949093072 | 0.406 | -0.203 | 0.135 |
| 3.103893541746661 | 0.406 | -0.203 | 0.135 |
| 3.107035134400251 | 0.406 | -0.203 | 0.135 |
| 3.110176727053841 | 0.406 | -0.203 | 0.135 |
| 3.11331831970743 | 0.406 | -0.203 | 0.135 |
| 3.11645991236102 | 0.406 | -0.203 | 0.135 |
| 3.11960150501461 | 0.406 | -0.203 | 0.135 |
| 3.122743097668199 | 0.406 | -0.203 | 0.135 |
| 3.125884690321789 | 0.406 | -0.203 | 0.135 |
| 3.129026282975378 | 0.406 | -0.203 | 0.135 |
| 3.132167875628968 | 0.406 | -0.203 | 0.135 |
| 3.135309468282557 | 0.406 | -0.203 | 0.135 |
| 3.138451060936147 | 0.406 | -0.203 | 0.135 |
| 3.141592653589737 | 0.406 | -0.203 | 0.135 |
| 3.144734246243326 | 0.406 | -0.203 | 0.135 |
| 3.147875838896916 | 0.406 | -0.203 | 0.135 |
| 3.151017431550505 | 0.406 | -0.203 | 0.135 |
| 3.154159024204095 | 0.406 | -0.203 | 0.135 |
| 3.157300616857685 | 0.406 | -0.203 | 0.135 |
| 3.160442209511274 | 0.406 | -0.203 | 0.135 |
| 3.163583802164864 | 0.406 | -0.203 | 0.135 |
| 3.166725394818453 | 0.406 | -0.203 | 0.135 |
| 3.169866987472043 | 0.406 | -0.203 | 0.135 |
| 3.173008580125633 | 0.406 | -0.203 | 0.135 |
| 3.176150172779222 | 0.406 | -0.203 | 0.135 |
| 3.179291765432812 | 0.406 | -0.203 | 0.135 |
| 3.182433358086401 | 0.406 | -0.203 | 0.135 |
| 3.185574950739991 | 0.406 | -0.203 | 0.135 |
| 3.188716543393581 | 0.406 | -0.203 | 0.135 |
| 3.19185813604717 | 0.406 | -0.203 | 0.135 |
| 3.19499972870076 | 0.406 | -0.203 | 0.135 |
| 3.198141321354349 | 0.406 | -0.203 | 0.135 |
| 3.20128291400794 | 0.406 | -0.203 | 0.135 |
| 3.204424506661528 | 0.406 | -0.203 | 0.135 |
| 3.207566099315118 | 0.406 | -0.203 | 0.135 |
| 3.210707691968708 | 0.406 | -0.203 | 0.135 |
| 3.213849284622297 | 0.406 | -0.203 | 0.135 |
| 3.216990877275887 | 0.406 | -0.203 | 0.135 |
| 3.220132469929476 | 0.406 | -0.203 | 0.135 |
| 3.223274062583066 | 0.406 | -0.203 | 0.135 |
| 3.226415655236656 | 0.406 | -0.203 | 0.135 |
| 3.229557247890245 | 0.406 | -0.203 | 0.135 |
| 3.232698840543835 | 0.406 | -0.203 | 0.135 |
| 3.235840433197425 | 0.406 | -0.203 | 0.135 |
| 3.238982025851014 | 0.406 | -0.203 | 0.135 |
| 3.242123618504604 | 0.406 | -0.203 | 0.135 |
| 3.245265211158193 | 0.406 | -0.203 | 0.135 |
| 3.248406803811783 | 0.406 | -0.203 | 0.135 |
| 3.251548396465373 | 0.406 | -0.203 | 0.135 |
| 3.254689989118962 | 0.406 | -0.203 | 0.135 |
| 3.257831581772551 | 0.406 | -0.203 | 0.135 |
| 3.260973174426141 | 0.406 | -0.203 | 0.135 |
| 3.26411476707973 | 0.406 | -0.203 | 0.135 |
| 3.267256359733321 | 0.406 | -0.203 | 0.135 |
| 3.27039795238691 | 0.406 | -0.203 | 0.135 |
| 3.2735395450405 | 0.406 | -0.203 | 0.135 |
| 3.276681137694089 | 0.406 | -0.203 | 0.135 |
| 3.279822730347679 | 0.406 | -0.203 | 0.135 |
| 3.282964323001269 | 0.406 | -0.203 | 0.135 |
| 3.286105915654858 | 0.406 | -0.203 | 0.135 |
| 3.289247508308448 | 0.406 | -0.203 | 0.135 |
| 3.292389100962037 | 0.406 | -0.203 | 0.135 |
| 3.295530693615627 | 0.406 | -0.203 | 0.135 |
| 3.298672286269217 | 0.406 | -0.203 | 0.135 |
| 3.301813878922806 | 0.406 | -0.203 | 0.135 |
| 3.304955471576396 | 0.406 | -0.203 | 0.135 |
| 3.308097064229985 | 0.406 | -0.203 | 0.135 |
| 3.311238656883575 | 0.406 | -0.203 | 0.135 |
| 3.314380249537165 | 0.406 | -0.203 | 0.135 |
| 3.317521842190754 | 0.406 | -0.203 | 0.135 |
| 3.320663434844344 | 0.406 | -0.203 | 0.135 |
| 3.323805027497933 | 0.406 | -0.203 | 0.135 |
| 3.326946620151523 | 0.406 | -0.203 | 0.135 |
| 3.330088212805113 | 0.406 | -0.203 | 0.135 |
| 3.333229805458702 | 0.406 | -0.203 | 0.135 |
| 3.336371398112292 | 0.406 | -0.203 | 0.135 |
| 3.339512990765881 | 0.406 | -0.203 | 0.135 |
| 3.342654583419471 | 0.406 | -0.203 | 0.135 |
| 3.345796176073061 | 0.406 | -0.203 | 0.135 |
| 3.34893776872665 | 0.406 | -0.203 | 0.135 |
| 3.35207936138024 | 0.406 | -0.203 | 0.135 |
| 3.355220954033829 | 0.406 | -0.203 | 0.135 |
| 3.358362546687419 | 0.406 | -0.203 | 0.135 |
| 3.361504139341009 | 0.406 | -0.203 | 0.135 |
| 3.364645731994598 | 0.406 | -0.203 | 0.135 |
| 3.367787324648188 | 0.406 | -0.203 | 0.135 |
| 3.370928917301777 | 0.406 | -0.203 | 0.135 |
| 3.374070509955367 | 0.406 | -0.203 | 0.135 |
| 3.377212102608956 | 0.406 | -0.203 | 0.135 |
| 3.380353695262546 | 0.406 | -0.203 | 0.135 |
| 3.383495287916136 | 0.406 | -0.203 | 0.135 |
| 3.386636880569725 | 0.406 | -0.203 | 0.135 |
| 3.389778473223315 | 0.406 | -0.203 | 0.135 |
| 3.392920065876904 | 0.406 | -0.203 | 0.134 |
| 3.396061658530494 | 0.406 | -0.203 | 0.134 |
| 3.399203251184084 | 0.406 | -0.203 | 0.134 |
| 3.402344843837673 | 0.406 | -0.203 | 0.134 |
| 3.405486436491263 | 0.406 | -0.203 | 0.134 |
| 3.408628029144852 | 0.406 | -0.203 | 0.134 |
| 3.411769621798442 | 0.406 | -0.203 | 0.134 |
| 3.414911214452032 | 0.406 | -0.203 | 0.133 |
| 3.418052807105621 | 0.406 | -0.203 | 0.133 |
| 3.421194399759211 | 0.406 | -0.203 | 0.133 |
| 3.4243359924128 | 0.406 | -0.203 | 0.133 |
| 3.42747758506639 | 0.406 | -0.203 | 0.133 |
| 3.43061917771998 | 0.406 | -0.203 | 0.132 |
| 3.433760770373569 | 0.406 | -0.203 | 0.132 |
| 3.436902363027159 | 0.406 | -0.203 | 0.132 |
| 3.440043955680748 | 0.406 | -0.203 | 0.131 |
| 3.443185548334338 | 0.406 | -0.203 | 0.131 |
| 3.446327140987927 | 0.406 | -0.203 | 0.131 |
| 3.449468733641517 | 0.406 | -0.203 | 0.13 |
| 3.452610326295107 | 0.406 | -0.203 | 0.13 |
| 3.455751918948696 | 0.406 | -0.203 | 0.129 |
| 3.458893511602286 | 0.406 | -0.203 | 0.129 |
| 3.462035104255876 | 0.406 | -0.203 | 0.128 |
| 3.465176696909465 | 0.406 | -0.203 | 0.128 |
| 3.468318289563055 | 0.406 | -0.203 | 0.127 |
| 3.471459882216644 | 0.406 | -0.203 | 0.127 |
| 3.474601474870234 | 0.406 | -0.203 | 0.126 |
| 3.477743067523824 | 0.406 | -0.203 | 0.125 |
| 3.480884660177413 | 0.406 | -0.203 | 0.125 |
| 3.484026252831002 | 0.406 | -0.203 | 0.124 |
| 3.487167845484592 | 0.406 | -0.202 | 0.123 |
| 3.490309438138182 | 0.406 | -0.202 | 0.122 |
| 3.493451030791772 | 0.406 | -0.202 | 0.121 |
| 3.496592623445361 | 0.406 | -0.202 | 0.12 |
| 3.499734216098951 | 0.406 | -0.202 | 0.12 |
| 3.50287580875254 | 0.406 | -0.202 | 0.119 |
| 3.50601740140613 | 0.406 | -0.202 | 0.117 |
| 3.50915899405972 | 0.406 | -0.202 | 0.116 |
| 3.512300586713309 | 0.406 | -0.202 | 0.115 |
| 3.515442179366899 | 0.406 | -0.202 | 0.114 |
| 3.518583772020488 | 0.406 | -0.202 | 0.113 |
| 3.521725364674078 | 0.406 | -0.202 | 0.111 |
| 3.524866957327668 | 0.406 | -0.202 | 0.11 |
| 3.528008549981257 | 0.406 | -0.201 | 0.109 |
| 3.531150142634847 | 0.406 | -0.201 | 0.107 |
| 3.534291735288436 | 0.406 | -0.201 | 0.106 |
| 3.537433327942026 | 0.406 | -0.201 | 0.104 |
| 3.540574920595616 | 0.406 | -0.201 | 0.103 |
| 3.543716513249205 | 0.406 | -0.201 | 0.101 |
| 3.546858105902795 | 0.406 | -0.2 | 0.099 |
| 3.549999698556384 | 0.406 | -0.2 | 0.097 |
| 3.553141291209974 | 0.406 | -0.2 | 0.095 |
| 3.556282883863564 | 0.406 | -0.2 | 0.094 |
| 3.559424476517153 | 0.406 | -0.2 | 0.092 |
| 3.562566069170743 | 0.406 | -0.2 | 0.09 |
| 3.565707661824332 | 0.406 | -0.199 | 0.088 |
| 3.568849254477922 | 0.406 | -0.199 | 0.085 |
| 3.571990847131511 | 0.406 | -0.199 | 0.083 |
| 3.575132439785101 | 0.406 | -0.199 | 0.081 |
| 3.578274032438691 | 0.406 | -0.198 | 0.079 |
| 3.58141562509228 | 0.406 | -0.198 | 0.076 |
| 3.58455721774587 | 0.406 | -0.198 | 0.074 |
| 3.58769881039946 | 0.406 | -0.197 | 0.072 |
| 3.590840403053049 | 0.406 | -0.197 | 0.069 |
| 3.593981995706639 | 0.406 | -0.197 | 0.067 |
| 3.597123588360228 | 0.406 | -0.196 | 0.064 |
| 3.600265181013818 | 0.406 | -0.196 | 0.061 |
| 3.603406773667407 | 0.406 | -0.195 | 0.059 |
| 3.606548366320997 | 0.406 | -0.195 | 0.056 |
| 3.609689958974587 | 0.406 | -0.195 | 0.053 |
| 3.612831551628176 | 0.406 | -0.194 | 0.05 |
| 3.615973144281766 | 0.406 | -0.194 | 0.048 |
| 3.619114736935355 | 0.406 | -0.193 | 0.045 |
| 3.622256329588945 | 0.406 | -0.193 | 0.042 |
| 3.625397922242534 | 0.406 | -0.192 | 0.039 |
| 3.628539514896124 | 0.406 | -0.192 | 0.036 |
| 3.631681107549714 | 0.406 | -0.191 | 0.033 |
| 3.634822700203303 | 0.406 | -0.19 | 0.03 |
| 3.637964292856893 | 0.406 | -0.19 | 0.027 |
| 3.641105885510483 | 0.406 | -0.189 | 0.024 |
| 3.644247478164072 | 0.406 | -0.188 | 0.021 |
| 3.647389070817662 | 0.406 | -0.188 | 0.018 |
| 3.650530663471251 | 0.406 | -0.187 | 0.015 |
| 3.653672256124841 | 0.406 | -0.186 | 0.011 |
| 3.656813848778431 | 0.406 | -0.185 | 0.008 |
| 3.65995544143202 | 0.406 | -0.185 | 0.005 |
| 3.66309703408561 | 0.406 | -0.184 | 0.002 |
| 3.666238626739199 | 0.406 | -0.183 | -0.001 |
| 3.66938021939279 | 0.406 | -0.182 | -0.004 |
| 3.672521812046378 | 0.406 | -0.181 | -0.007 |
| 3.675663404699968 | 0.406 | -0.18 | -0.01 |
| 3.678804997353558 | 0.406 | -0.179 | -0.014 |
| 3.681946590007147 | 0.406 | -0.178 | -0.017 |
| 3.685088182660737 | 0.406 | -0.177 | -0.02 |
| 3.688229775314326 | 0.406 | -0.176 | -0.023 |
| 3.691371367967916 | 0.406 | -0.175 | -0.026 |
| 3.694512960621506 | 0.406 | -0.174 | -0.029 |
| 3.697654553275095 | 0.406 | -0.173 | -0.032 |
| 3.700796145928685 | 0.406 | -0.172 | -0.035 |
| 3.703937738582274 | 0.406 | -0.17 | -0.038 |
| 3.707079331235864 | 0.406 | -0.169 | -0.041 |
| 3.710220923889454 | 0.406 | -0.168 | -0.044 |
| 3.713362516543043 | 0.406 | -0.167 | -0.047 |
| 3.716504109196633 | 0.406 | -0.165 | -0.05 |
| 3.719645701850223 | 0.406 | -0.164 | -0.052 |
| 3.722787294503812 | 0.406 | -0.162 | -0.055 |
| 3.725928887157402 | 0.406 | -0.161 | -0.058 |
| 3.729070479810991 | 0.406 | -0.159 | -0.061 |
| 3.732212072464581 | 0.406 | -0.158 | -0.063 |
| 3.735353665118171 | 0.406 | -0.156 | -0.066 |
| 3.73849525777176 | 0.406 | -0.155 | -0.068 |
| 3.74163685042535 | 0.406 | -0.153 | -0.071 |
| 3.744778443078939 | 0.406 | -0.151 | -0.073 |
| 3.747920035732529 | 0.406 | -0.15 | -0.076 |
| 3.751061628386119 | 0.406 | -0.148 | -0.078 |
| 3.754203221039708 | 0.406 | -0.146 | -0.08 |
| 3.757344813693298 | 0.406 | -0.144 | -0.083 |
| 3.760486406346887 | 0.406 | -0.142 | -0.085 |
| 3.763627999000477 | 0.406 | -0.14 | -0.087 |
| 3.766769591654067 | 0.406 | -0.138 | -0.089 |
| 3.769911184307656 | 0.406 | -0.136 | -0.091 |
| 3.773052776961246 | 0.406 | -0.134 | -0.093 |
| 3.776194369614835 | 0.406 | -0.132 | -0.095 |
| 3.779335962268425 | 0.406 | -0.13 | -0.097 |
| 3.782477554922014 | 0.406 | -0.128 | -0.099 |
| 3.785619147575604 | 0.406 | -0.126 | -0.1 |
| 3.788760740229193 | 0.406 | -0.124 | -0.102 |
| 3.791902332882783 | 0.406 | -0.122 | -0.104 |
| 3.795043925536373 | 0.406 | -0.119 | -0.105 |
| 3.798185518189962 | 0.405 | -0.117 | -0.107 |
| 3.801327110843552 | 0.405 | -0.115 | -0.108 |
| 3.804468703497142 | 0.405 | -0.112 | -0.11 |
| 3.807610296150731 | 0.405 | -0.11 | -0.111 |
| 3.810751888804321 | 0.405 | -0.107 | -0.112 |
| 3.813893481457911 | 0.405 | -0.105 | -0.114 |
| 3.8170350741115 | 0.405 | -0.102 | -0.115 |
| 3.82017666676509 | 0.405 | -0.1 | -0.116 |
| 3.823318259418679 | 0.405 | -0.097 | -0.117 |
| 3.826459852072269 | 0.405 | -0.095 | -0.118 |
| 3.829601444725859 | 0.405 | -0.092 | -0.119 |
| 3.832743037379448 | 0.405 | -0.089 | -0.12 |
| 3.835884630033038 | 0.405 | -0.087 | -0.121 |
| 3.839026222686627 | 0.405 | -0.084 | -0.122 |
| 3.842167815340217 | 0.405 | -0.081 | -0.123 |
| 3.845309407993807 | 0.405 | -0.079 | -0.124 |
| 3.848451000647396 | 0.405 | -0.076 | -0.124 |
| 3.851592593300986 | 0.405 | -0.073 | -0.125 |
| 3.854734185954575 | 0.405 | -0.07 | -0.126 |
| 3.857875778608165 | 0.404 | -0.067 | -0.127 |
| 3.861017371261755 | 0.404 | -0.064 | -0.127 |
| 3.864158963915344 | 0.404 | -0.061 | -0.128 |
| 3.867300556568933 | 0.404 | -0.058 | -0.128 |
| 3.870442149222523 | 0.404 | -0.055 | -0.129 |
| 3.873583741876112 | 0.404 | -0.053 | -0.129 |
| 3.876725334529703 | 0.404 | -0.05 | -0.13 |
| 3.879866927183292 | 0.404 | -0.047 | -0.13 |
| 3.883008519836882 | 0.404 | -0.043 | -0.131 |
| 3.886150112490471 | 0.404 | -0.04 | -0.131 |
| 3.889291705144061 | 0.404 | -0.037 | -0.131 |
| 3.892433297797651 | 0.404 | -0.034 | -0.132 |
| 3.89557489045124 | 0.403 | -0.031 | -0.132 |
| 3.89871648310483 | 0.403 | -0.028 | -0.132 |
| 3.901858075758419 | 0.403 | -0.025 | -0.133 |
| 3.904999668412009 | 0.403 | -0.022 | -0.133 |
| 3.908141261065598 | 0.403 | -0.019 | -0.133 |
| 3.911282853719188 | 0.403 | -0.016 | -0.133 |
| 3.914424446372778 | 0.403 | -0.013 | -0.133 |
| 3.917566039026367 | 0.403 | -0.009 | -0.134 |
| 3.920707631679957 | 0.403 | -0.006 | -0.134 |
| 3.923849224333547 | 0.402 | -0.003 | -0.134 |
| 3.926990816987136 | 0.402 | 0 | -0.134 |
| 3.930132409640726 | 0.402 | 0.003 | -0.134 |
| 3.933274002294315 | 0.402 | 0.006 | -0.134 |
| 3.936415594947905 | 0.402 | 0.009 | -0.134 |
| 3.939557187601495 | 0.402 | 0.013 | -0.135 |
| 3.942698780255084 | 0.401 | 0.016 | -0.135 |
| 3.945840372908674 | 0.401 | 0.019 | -0.135 |
| 3.948981965562263 | 0.401 | 0.022 | -0.135 |
| 3.952123558215853 | 0.401 | 0.025 | -0.135 |
| 3.955265150869442 | 0.401 | 0.028 | -0.135 |
| 3.958406743523032 | 0.401 | 0.031 | -0.135 |
| 3.961548336176622 | 0.4 | 0.034 | -0.135 |
| 3.964689928830211 | 0.4 | 0.037 | -0.135 |
| 3.967831521483801 | 0.4 | 0.04 | -0.135 |
| 3.97097311413739 | 0.4 | 0.043 | -0.135 |
| 3.97411470679098 | 0.4 | 0.047 | -0.135 |
| 3.97725629944457 | 0.399 | 0.05 | -0.135 |
| 3.98039789209816 | 0.399 | 0.053 | -0.135 |
| 3.983539484751749 | 0.399 | 0.055 | -0.135 |
| 3.986681077405338 | 0.399 | 0.058 | -0.135 |
| 3.989822670058928 | 0.399 | 0.061 | -0.135 |
| 3.992964262712517 | 0.398 | 0.064 | -0.135 |
| 3.996105855366107 | 0.398 | 0.067 | -0.135 |
| 3.999247448019697 | 0.398 | 0.07 | -0.135 |
| 4.002389040673287 | 0.398 | 0.073 | -0.135 |
| 4.005530633326877 | 0.397 | 0.076 | -0.135 |
| 4.008672225980466 | 0.397 | 0.079 | -0.135 |
| 4.011813818634056 | 0.397 | 0.081 | -0.135 |
| 4.014955411287645 | 0.396 | 0.084 | -0.135 |
| 4.018097003941234 | 0.396 | 0.087 | -0.135 |
| 4.021238596594824 | 0.396 | 0.089 | -0.135 |
| 4.024380189248414 | 0.396 | 0.092 | -0.135 |
| 4.027521781902004 | 0.395 | 0.095 | -0.135 |
| 4.030663374555593 | 0.395 | 0.097 | -0.135 |
| 4.033804967209183 | 0.395 | 0.1 | -0.135 |
| 4.036946559862773 | 0.394 | 0.102 | -0.135 |
| 4.040088152516362 | 0.394 | 0.105 | -0.135 |
| 4.043229745169951 | 0.394 | 0.107 | -0.135 |
| 4.046371337823541 | 0.393 | 0.11 | -0.135 |
| 4.049512930477131 | 0.393 | 0.112 | -0.135 |
| 4.05265452313072 | 0.392 | 0.115 | -0.135 |
| 4.05579611578431 | 0.392 | 0.117 | -0.135 |
| 4.0589377084379 | 0.392 | 0.119 | -0.135 |
| 4.062079301091489 | 0.391 | 0.122 | -0.135 |
| 4.065220893745079 | 0.391 | 0.124 | -0.135 |
| 4.068362486398668 | 0.391 | 0.126 | -0.135 |
| 4.071504079052258 | 0.39 | 0.128 | -0.135 |
| 4.074645671705848 | 0.39 | 0.13 | -0.135 |
| 4.077787264359437 | 0.389 | 0.132 | -0.135 |
| 4.080928857013027 | 0.389 | 0.134 | -0.135 |
| 4.084070449666616 | 0.388 | 0.136 | -0.135 |
| 4.087212042320206 | 0.388 | 0.138 | -0.135 |
| 4.090353634973795 | 0.387 | 0.14 | -0.135 |
| 4.093495227627385 | 0.387 | 0.142 | -0.135 |
| 4.096636820280975 | 0.386 | 0.144 | -0.135 |
| 4.099778412934564 | 0.386 | 0.146 | -0.135 |
| 4.102920005588154 | 0.385 | 0.148 | -0.135 |
| 4.106061598241744 | 0.385 | 0.15 | -0.135 |
| 4.109203190895333 | 0.384 | 0.151 | -0.135 |
| 4.112344783548923 | 0.384 | 0.153 | -0.135 |
| 4.115486376202512 | 0.383 | 0.155 | -0.135 |
| 4.118627968856102 | 0.383 | 0.156 | -0.135 |
| 4.121769561509692 | 0.382 | 0.158 | -0.135 |
| 4.124911154163281 | 0.381 | 0.159 | -0.135 |
| 4.128052746816871 | 0.381 | 0.161 | -0.135 |
| 4.13119433947046 | 0.38 | 0.162 | -0.135 |
| 4.13433593212405 | 0.38 | 0.164 | -0.135 |
| 4.13747752477764 | 0.379 | 0.165 | -0.135 |
| 4.14061911743123 | 0.378 | 0.167 | -0.135 |
| 4.143760710084818 | 0.378 | 0.168 | -0.135 |
| 4.146902302738408 | 0.377 | 0.169 | -0.135 |
| 4.150043895391998 | 0.376 | 0.17 | -0.135 |
| 4.153185488045588 | 0.375 | 0.172 | -0.135 |
| 4.156327080699177 | 0.375 | 0.173 | -0.135 |
| 4.159468673352766 | 0.374 | 0.174 | -0.135 |
| 4.162610266006356 | 0.373 | 0.175 | -0.135 |
| 4.165751858659946 | 0.373 | 0.176 | -0.135 |
| 4.168893451313535 | 0.372 | 0.177 | -0.135 |
| 4.172035043967125 | 0.371 | 0.178 | -0.135 |
| 4.175176636620715 | 0.37 | 0.179 | -0.135 |
| 4.178318229274304 | 0.369 | 0.18 | -0.135 |
| 4.181459821927894 | 0.369 | 0.181 | -0.135 |
| 4.184601414581484 | 0.368 | 0.182 | -0.135 |
| 4.187743007235073 | 0.367 | 0.183 | -0.135 |
| 4.190884599888663 | 0.366 | 0.184 | -0.135 |
| 4.194026192542252 | 0.365 | 0.185 | -0.135 |
| 4.197167785195842 | 0.364 | 0.185 | -0.135 |
| 4.200309377849432 | 0.363 | 0.186 | -0.135 |
| 4.203450970503021 | 0.362 | 0.187 | -0.135 |
| 4.206592563156611 | 0.361 | 0.188 | -0.135 |
| 4.2097341558102 | 0.361 | 0.188 | -0.135 |
| 4.21287574846379 | 0.36 | 0.189 | -0.135 |
| 4.21601734111738 | 0.359 | 0.19 | -0.135 |
| 4.21915893377097 | 0.358 | 0.19 | -0.135 |
| 4.222300526424559 | 0.357 | 0.191 | -0.135 |
| 4.225442119078148 | 0.356 | 0.192 | -0.135 |
| 4.228583711731738 | 0.355 | 0.192 | -0.135 |
| 4.231725304385327 | 0.353 | 0.193 | -0.135 |
| 4.234866897038917 | 0.352 | 0.193 | -0.135 |
| 4.238008489692506 | 0.351 | 0.194 | -0.135 |
| 4.241150082346096 | 0.35 | 0.194 | -0.135 |
| 4.244291674999685 | 0.349 | 0.195 | -0.135 |
| 4.247433267653276 | 0.348 | 0.195 | -0.135 |
| 4.250574860306865 | 0.347 | 0.195 | -0.135 |
| 4.253716452960455 | 0.346 | 0.196 | -0.135 |
| 4.256858045614044 | 0.344 | 0.196 | -0.135 |
| 4.259999638267634 | 0.343 | 0.197 | -0.135 |
| 4.263141230921224 | 0.342 | 0.197 | -0.135 |
| 4.266282823574813 | 0.341 | 0.197 | -0.135 |
| 4.269424416228403 | 0.34 | 0.198 | -0.135 |
| 4.272566008881992 | 0.338 | 0.198 | -0.135 |
| 4.275707601535582 | 0.337 | 0.198 | -0.135 |
| 4.27884919418917 | 0.336 | 0.199 | -0.135 |
| 4.28199078684276 | 0.334 | 0.199 | -0.135 |
| 4.285132379496351 | 0.333 | 0.199 | -0.135 |
| 4.28827397214994 | 0.332 | 0.199 | -0.135 |
| 4.29141556480353 | 0.33 | 0.2 | -0.135 |
| 4.294557157457119 | 0.329 | 0.2 | -0.135 |
| 4.29769875011071 | 0.327 | 0.2 | -0.135 |
| 4.300840342764299 | 0.326 | 0.2 | -0.135 |
| 4.303981935417888 | 0.325 | 0.2 | -0.135 |
| 4.307123528071478 | 0.323 | 0.2 | -0.135 |
| 4.310265120725067 | 0.322 | 0.201 | -0.135 |
| 4.313406713378657 | 0.32 | 0.201 | -0.135 |
| 4.316548306032247 | 0.319 | 0.201 | -0.135 |
| 4.319689898685836 | 0.317 | 0.201 | -0.135 |
| 4.322831491339426 | 0.316 | 0.201 | -0.135 |
| 4.325973083993015 | 0.314 | 0.201 | -0.135 |
| 4.329114676646605 | 0.312 | 0.202 | -0.135 |
| 4.332256269300195 | 0.311 | 0.202 | -0.135 |
| 4.335397861953784 | 0.309 | 0.202 | -0.135 |
| 4.338539454607374 | 0.308 | 0.202 | -0.135 |
| 4.341681047260963 | 0.306 | 0.202 | -0.135 |
| 4.344822639914553 | 0.304 | 0.202 | -0.135 |
| 4.347964232568143 | 0.303 | 0.202 | -0.135 |
| 4.351105825221732 | 0.301 | 0.202 | -0.135 |
| 4.354247417875322 | 0.299 | 0.202 | -0.135 |
| 4.357389010528911 | 0.297 | 0.202 | -0.135 |
| 4.360530603182501 | 0.296 | 0.202 | -0.135 |
| 4.36367219583609 | 0.294 | 0.202 | -0.135 |
| 4.36681378848968 | 0.292 | 0.202 | -0.135 |
| 4.36995538114327 | 0.29 | 0.203 | -0.135 |
| 4.373096973796859 | 0.288 | 0.203 | -0.135 |
| 4.376238566450449 | 0.286 | 0.203 | -0.135 |
| 4.379380159104038 | 0.285 | 0.203 | -0.135 |
| 4.382521751757628 | 0.283 | 0.203 | -0.135 |
| 4.385663344411217 | 0.281 | 0.203 | -0.135 |
| 4.388804937064807 | 0.279 | 0.203 | -0.135 |
| 4.391946529718397 | 0.277 | 0.203 | -0.135 |
| 4.395088122371987 | 0.275 | 0.203 | -0.135 |
| 4.398229715025576 | 0.273 | 0.203 | -0.135 |
| 4.401371307679165 | 0.271 | 0.203 | -0.135 |
| 4.404512900332755 | 0.269 | 0.203 | -0.135 |
| 4.407654492986345 | 0.267 | 0.203 | -0.135 |
| 4.410796085639934 | 0.265 | 0.203 | -0.135 |
| 4.413937678293524 | 0.263 | 0.203 | -0.135 |
| 4.417079270947114 | 0.261 | 0.203 | -0.135 |
| 4.420220863600703 | 0.258 | 0.203 | -0.135 |
| 4.423362456254293 | 0.256 | 0.203 | -0.135 |
| 4.426504048907883 | 0.254 | 0.203 | -0.135 |
| 4.429645641561472 | 0.252 | 0.203 | -0.135 |
| 4.432787234215062 | 0.25 | 0.203 | -0.135 |
| 4.435928826868651 | 0.248 | 0.203 | -0.135 |
| 4.43907041952224 | 0.245 | 0.203 | -0.135 |
| 4.44221201217583 | 0.243 | 0.203 | -0.134 |
| 4.44535360482942 | 0.241 | 0.203 | -0.134 |
| 4.44849519748301 | 0.239 | 0.203 | -0.134 |
| 4.4516367901366 | 0.236 | 0.203 | -0.134 |
| 4.454778382790188 | 0.234 | 0.203 | -0.134 |
| 4.457919975443779 | 0.232 | 0.203 | -0.134 |
| 4.461061568097368 | 0.229 | 0.203 | -0.134 |
| 4.464203160750958 | 0.227 | 0.203 | -0.133 |
| 4.467344753404547 | 0.225 | 0.203 | -0.133 |
| 4.470486346058137 | 0.222 | 0.203 | -0.133 |
| 4.473627938711726 | 0.22 | 0.203 | -0.133 |
| 4.476769531365316 | 0.217 | 0.203 | -0.132 |
| 4.479911124018905 | 0.215 | 0.203 | -0.132 |
| 4.483052716672495 | 0.212 | 0.203 | -0.132 |
| 4.486194309326085 | 0.21 | 0.203 | -0.132 |
| 4.489335901979674 | 0.207 | 0.203 | -0.131 |
| 4.492477494633264 | 0.205 | 0.203 | -0.131 |
| 4.495619087286854 | 0.202 | 0.203 | -0.13 |
| 4.498760679940443 | 0.2 | 0.203 | -0.13 |
| 4.501902272594033 | 0.197 | 0.203 | -0.13 |
| 4.505043865247622 | 0.195 | 0.203 | -0.129 |
| 4.508185457901212 | 0.192 | 0.203 | -0.129 |
| 4.511327050554801 | 0.189 | 0.203 | -0.128 |
| 4.514468643208391 | 0.187 | 0.203 | -0.128 |
| 4.517610235861981 | 0.184 | 0.203 | -0.127 |
| 4.520751828515571 | 0.182 | 0.203 | -0.126 |
| 4.52389342116916 | 0.179 | 0.203 | -0.126 |
| 4.52703501382275 | 0.176 | 0.203 | -0.125 |
| 4.530176606476339 | 0.174 | 0.203 | -0.124 |
| 4.533318199129928 | 0.171 | 0.203 | -0.123 |
| 4.536459791783518 | 0.168 | 0.203 | -0.123 |
| 4.539601384437108 | 0.165 | 0.203 | -0.122 |
| 4.542742977090698 | 0.163 | 0.203 | -0.121 |
| 4.545884569744287 | 0.16 | 0.203 | -0.12 |
| 4.549026162397876 | 0.157 | 0.203 | -0.119 |
| 4.552167755051466 | 0.154 | 0.203 | -0.118 |
| 4.555309347705056 | 0.151 | 0.203 | -0.117 |
| 4.558450940358646 | 0.149 | 0.203 | -0.116 |
| 4.561592533012235 | 0.146 | 0.203 | -0.114 |
| 4.564734125665825 | 0.143 | 0.203 | -0.113 |
| 4.567875718319415 | 0.14 | 0.203 | -0.112 |
| 4.571017310973004 | 0.137 | 0.203 | -0.111 |
| 4.574158903626594 | 0.134 | 0.203 | -0.109 |
| 4.577300496280183 | 0.131 | 0.203 | -0.108 |
| 4.580442088933772 | 0.129 | 0.203 | -0.106 |
| 4.583583681587362 | 0.126 | 0.203 | -0.105 |
| 4.586725274240952 | 0.123 | 0.203 | -0.103 |
| 4.589866866894542 | 0.12 | 0.203 | -0.101 |
| 4.593008459548131 | 0.117 | 0.203 | -0.1 |
| 4.596150052201721 | 0.114 | 0.203 | -0.098 |
| 4.59929164485531 | 0.111 | 0.203 | -0.096 |
| 4.6024332375089 | 0.108 | 0.203 | -0.094 |
| 4.60557483016249 | 0.105 | 0.203 | -0.092 |
| 4.608716422816079 | 0.102 | 0.203 | -0.09 |
| 4.611858015469668 | 0.099 | 0.203 | -0.088 |
| 4.614999608123258 | 0.096 | 0.203 | -0.086 |
| 4.618141200776848 | 0.093 | 0.203 | -0.084 |
| 4.621282793430437 | 0.09 | 0.203 | -0.082 |
| 4.624424386084027 | 0.087 | 0.203 | -0.08 |
| 4.627565978737617 | 0.084 | 0.203 | -0.077 |
| 4.630707571391206 | 0.081 | 0.203 | -0.075 |
| 4.633849164044795 | 0.078 | 0.203 | -0.072 |
| 4.636990756698386 | 0.075 | 0.203 | -0.07 |
| 4.640132349351975 | 0.072 | 0.203 | -0.067 |
| 4.643273942005564 | 0.069 | 0.203 | -0.065 |
| 4.646415534659154 | 0.066 | 0.203 | -0.062 |
| 4.649557127312744 | 0.062 | 0.203 | -0.06 |
| 4.652698719966334 | 0.059 | 0.203 | -0.057 |
| 4.655840312619923 | 0.056 | 0.203 | -0.054 |
| 4.658981905273513 | 0.053 | 0.203 | -0.051 |
| 4.662123497927102 | 0.05 | 0.203 | -0.049 |
| 4.665265090580692 | 0.047 | 0.203 | -0.046 |
| 4.668406683234282 | 0.044 | 0.203 | -0.043 |
| 4.671548275887871 | 0.041 | 0.203 | -0.04 |
| 4.674689868541461 | 0.038 | 0.203 | -0.037 |
| 4.67783146119505 | 0.034 | 0.203 | -0.034 |
| 4.68097305384864 | 0.031 | 0.203 | -0.031 |
| 4.68411464650223 | 0.028 | 0.203 | -0.028 |
| 4.687256239155819 | 0.025 | 0.203 | -0.025 |
| 4.690397831809409 | 0.022 | 0.203 | -0.022 |
| 4.693539424462998 | 0.019 | 0.203 | -0.019 |
| 4.696681017116588 | 0.016 | 0.203 | -0.016 |
| 4.699822609770177 | 0.013 | 0.203 | -0.013 |
| 4.702964202423767 | 0.009 | 0.203 | -0.009 |
| 4.706105795077356 | 0.006 | 0.203 | -0.006 |
| 4.709247387730946 | 0.003 | 0.203 | -0.003 |
| 4.712388980384535 | 0 | 0.203 | 0 |
| 4.715530573038126 | -0.003 | 0.203 | 0.003 |
| 4.718672165691715 | -0.006 | 0.203 | 0.006 |
| 4.721813758345305 | -0.009 | 0.203 | 0.009 |
| 4.724955350998894 | -0.013 | 0.203 | 0.013 |
| 4.728096943652484 | -0.016 | 0.203 | 0.016 |
| 4.731238536306074 | -0.019 | 0.203 | 0.019 |
| 4.734380128959663 | -0.022 | 0.203 | 0.022 |
| 4.737521721613253 | -0.025 | 0.203 | 0.025 |
| 4.740663314266842 | -0.028 | 0.203 | 0.028 |
| 4.743804906920432 | -0.031 | 0.203 | 0.031 |
| 4.74694649957402 | -0.034 | 0.203 | 0.034 |
| 4.750088092227611 | -0.038 | 0.203 | 0.037 |
| 4.7532296848812 | -0.041 | 0.203 | 0.04 |
| 4.75637127753479 | -0.044 | 0.203 | 0.043 |
| 4.75951287018838 | -0.047 | 0.203 | 0.046 |
| 4.76265446284197 | -0.05 | 0.203 | 0.049 |
| 4.765796055495559 | -0.053 | 0.203 | 0.051 |
| 4.768937648149149 | -0.056 | 0.203 | 0.054 |
| 4.772079240802738 | -0.059 | 0.203 | 0.057 |
| 4.775220833456327 | -0.062 | 0.203 | 0.06 |
| 4.778362426109917 | -0.066 | 0.203 | 0.062 |
| 4.781504018763507 | -0.069 | 0.203 | 0.065 |
| 4.784645611417097 | -0.072 | 0.203 | 0.067 |
| 4.787787204070686 | -0.075 | 0.203 | 0.07 |
| 4.790928796724275 | -0.078 | 0.203 | 0.072 |
| 4.794070389377865 | -0.081 | 0.203 | 0.075 |
| 4.797211982031455 | -0.084 | 0.203 | 0.077 |
| 4.800353574685045 | -0.087 | 0.203 | 0.08 |
| 4.803495167338634 | -0.09 | 0.203 | 0.082 |
| 4.806636759992224 | -0.093 | 0.203 | 0.084 |
| 4.809778352645814 | -0.096 | 0.203 | 0.086 |
| 4.812919945299403 | -0.099 | 0.203 | 0.088 |
| 4.816061537952993 | -0.102 | 0.203 | 0.09 |
| 4.819203130606582 | -0.105 | 0.203 | 0.092 |
| 4.822344723260172 | -0.108 | 0.203 | 0.094 |
| 4.825486315913761 | -0.111 | 0.203 | 0.096 |
| 4.828627908567351 | -0.114 | 0.203 | 0.098 |
| 4.83176950122094 | -0.117 | 0.203 | 0.1 |
| 4.83491109387453 | -0.12 | 0.203 | 0.101 |
| 4.83805268652812 | -0.123 | 0.203 | 0.103 |
| 4.841194279181709 | -0.126 | 0.203 | 0.105 |
| 4.844335871835299 | -0.129 | 0.203 | 0.106 |
| 4.847477464488889 | -0.131 | 0.203 | 0.108 |
| 4.850619057142478 | -0.134 | 0.203 | 0.109 |
| 4.853760649796068 | -0.137 | 0.203 | 0.111 |
| 4.856902242449657 | -0.14 | 0.203 | 0.112 |
| 4.860043835103247 | -0.143 | 0.203 | 0.113 |
| 4.863185427756837 | -0.146 | 0.203 | 0.114 |
| 4.866327020410426 | -0.149 | 0.203 | 0.116 |
| 4.869468613064015 | -0.151 | 0.203 | 0.117 |
| 4.872610205717605 | -0.154 | 0.203 | 0.118 |
| 4.875751798371195 | -0.157 | 0.203 | 0.119 |
| 4.878893391024784 | -0.16 | 0.203 | 0.12 |
| 4.882034983678374 | -0.163 | 0.203 | 0.121 |
| 4.885176576331964 | -0.165 | 0.203 | 0.122 |
| 4.888318168985553 | -0.168 | 0.203 | 0.123 |
| 4.891459761639143 | -0.171 | 0.203 | 0.123 |
| 4.894601354292733 | -0.174 | 0.203 | 0.124 |
| 4.897742946946322 | -0.176 | 0.203 | 0.125 |
| 4.900884539599912 | -0.179 | 0.203 | 0.126 |
| 4.904026132253501 | -0.182 | 0.203 | 0.126 |
| 4.907167724907091 | -0.184 | 0.203 | 0.127 |
| 4.91030931756068 | -0.187 | 0.203 | 0.128 |
| 4.91345091021427 | -0.189 | 0.203 | 0.128 |
| 4.91659250286786 | -0.192 | 0.203 | 0.129 |
| 4.91973409552145 | -0.195 | 0.203 | 0.129 |
| 4.922875688175039 | -0.197 | 0.203 | 0.13 |
| 4.926017280828628 | -0.2 | 0.203 | 0.13 |
| 4.929158873482218 | -0.202 | 0.203 | 0.13 |
| 4.932300466135808 | -0.205 | 0.203 | 0.131 |
| 4.935442058789397 | -0.207 | 0.203 | 0.131 |
| 4.938583651442987 | -0.21 | 0.203 | 0.132 |
| 4.941725244096576 | -0.212 | 0.203 | 0.132 |
| 4.944866836750166 | -0.215 | 0.203 | 0.132 |
| 4.948008429403755 | -0.217 | 0.203 | 0.132 |
| 4.951150022057345 | -0.22 | 0.203 | 0.133 |
| 4.954291614710935 | -0.222 | 0.203 | 0.133 |
| 4.957433207364524 | -0.225 | 0.203 | 0.133 |
| 4.960574800018114 | -0.227 | 0.203 | 0.133 |
| 4.963716392671704 | -0.229 | 0.203 | 0.134 |
| 4.966857985325293 | -0.232 | 0.203 | 0.134 |
| 4.969999577978883 | -0.234 | 0.203 | 0.134 |
| 4.973141170632472 | -0.236 | 0.203 | 0.134 |
| 4.976282763286062 | -0.239 | 0.203 | 0.134 |
| 4.979424355939651 | -0.241 | 0.203 | 0.134 |
| 4.982565948593241 | -0.243 | 0.203 | 0.134 |
| 4.985707541246831 | -0.245 | 0.203 | 0.135 |
| 4.98884913390042 | -0.248 | 0.203 | 0.135 |
| 4.99199072655401 | -0.25 | 0.203 | 0.135 |
| 4.9951323192076 | -0.252 | 0.203 | 0.135 |
| 4.99827391186119 | -0.254 | 0.203 | 0.135 |
| 5.00141550451478 | -0.256 | 0.203 | 0.135 |
| 5.004557097168369 | -0.258 | 0.203 | 0.135 |
| 5.007698689821958 | -0.261 | 0.203 | 0.135 |
| 5.010840282475548 | -0.263 | 0.203 | 0.135 |
| 5.013981875129137 | -0.265 | 0.203 | 0.135 |
| 5.017123467782727 | -0.267 | 0.203 | 0.135 |
| 5.020265060436317 | -0.269 | 0.203 | 0.135 |
| 5.023406653089906 | -0.271 | 0.203 | 0.135 |
| 5.026548245743496 | -0.273 | 0.203 | 0.135 |
| 5.029689838397085 | -0.275 | 0.203 | 0.135 |
| 5.032831431050674 | -0.277 | 0.203 | 0.135 |
| 5.035973023704264 | -0.279 | 0.203 | 0.135 |
| 5.039114616357854 | -0.281 | 0.203 | 0.135 |
| 5.042256209011444 | -0.283 | 0.203 | 0.135 |
| 5.045397801665033 | -0.285 | 0.203 | 0.135 |
| 5.048539394318622 | -0.286 | 0.203 | 0.135 |
| 5.051680986972213 | -0.288 | 0.203 | 0.135 |
| 5.054822579625802 | -0.29 | 0.203 | 0.135 |
| 5.057964172279392 | -0.292 | 0.202 | 0.135 |
| 5.061105764932981 | -0.294 | 0.202 | 0.135 |
| 5.064247357586571 | -0.296 | 0.202 | 0.135 |
| 5.067388950240161 | -0.297 | 0.202 | 0.135 |
| 5.07053054289375 | -0.299 | 0.202 | 0.135 |
| 5.07367213554734 | -0.301 | 0.202 | 0.135 |
| 5.07681372820093 | -0.303 | 0.202 | 0.135 |
| 5.079955320854519 | -0.304 | 0.202 | 0.135 |
| 5.083096913508108 | -0.306 | 0.202 | 0.135 |
| 5.086238506161698 | -0.308 | 0.202 | 0.135 |
| 5.089380098815288 | -0.309 | 0.202 | 0.135 |
| 5.092521691468877 | -0.311 | 0.202 | 0.135 |
| 5.095663284122466 | -0.312 | 0.202 | 0.135 |
| 5.098804876776057 | -0.314 | 0.201 | 0.135 |
| 5.101946469429646 | -0.316 | 0.201 | 0.135 |
| 5.105088062083236 | -0.317 | 0.201 | 0.135 |
| 5.108229654736825 | -0.319 | 0.201 | 0.135 |
| 5.111371247390415 | -0.32 | 0.201 | 0.135 |
| 5.114512840044005 | -0.322 | 0.201 | 0.135 |
| 5.117654432697594 | -0.323 | 0.2 | 0.135 |
| 5.120796025351184 | -0.325 | 0.2 | 0.135 |
| 5.123937618004773 | -0.326 | 0.2 | 0.135 |
| 5.127079210658363 | -0.327 | 0.2 | 0.135 |
| 5.130220803311953 | -0.329 | 0.2 | 0.135 |
| 5.133362395965542 | -0.33 | 0.2 | 0.135 |
| 5.136503988619131 | -0.332 | 0.199 | 0.135 |
| 5.13964558127272 | -0.333 | 0.199 | 0.135 |
| 5.142787173926311 | -0.334 | 0.199 | 0.135 |
| 5.1459287665799 | -0.336 | 0.199 | 0.135 |
| 5.14907035923349 | -0.337 | 0.198 | 0.135 |
| 5.15221195188708 | -0.338 | 0.198 | 0.135 |
| 5.15535354454067 | -0.34 | 0.198 | 0.135 |
| 5.158495137194259 | -0.341 | 0.197 | 0.135 |
| 5.161636729847848 | -0.342 | 0.197 | 0.135 |
| 5.164778322501438 | -0.343 | 0.197 | 0.135 |
| 5.167919915155028 | -0.344 | 0.196 | 0.135 |
| 5.171061507808617 | -0.346 | 0.196 | 0.135 |
| 5.174203100462206 | -0.347 | 0.195 | 0.135 |
| 5.177344693115796 | -0.348 | 0.195 | 0.135 |
| 5.180486285769386 | -0.349 | 0.195 | 0.135 |
| 5.183627878422976 | -0.35 | 0.194 | 0.135 |
| 5.186769471076565 | -0.351 | 0.194 | 0.135 |
| 5.189911063730155 | -0.352 | 0.193 | 0.135 |
| 5.193052656383744 | -0.353 | 0.193 | 0.135 |
| 5.196194249037334 | -0.355 | 0.192 | 0.135 |
| 5.199335841690924 | -0.356 | 0.192 | 0.135 |
| 5.202477434344513 | -0.357 | 0.191 | 0.135 |
| 5.205619026998103 | -0.358 | 0.19 | 0.135 |
| 5.208760619651692 | -0.359 | 0.19 | 0.135 |
| 5.211902212305282 | -0.36 | 0.189 | 0.135 |
| 5.215043804958871 | -0.361 | 0.188 | 0.135 |
| 5.218185397612461 | -0.361 | 0.188 | 0.135 |
| 5.221326990266051 | -0.362 | 0.187 | 0.135 |
| 5.22446858291964 | -0.363 | 0.186 | 0.135 |
| 5.22761017557323 | -0.364 | 0.185 | 0.135 |
| 5.23075176822682 | -0.365 | 0.185 | 0.135 |
| 5.23389336088041 | -0.366 | 0.184 | 0.135 |
| 5.237034953533999 | -0.367 | 0.183 | 0.135 |
| 5.240176546187588 | -0.368 | 0.182 | 0.135 |
| 5.243318138841178 | -0.369 | 0.181 | 0.135 |
| 5.246459731494767 | -0.369 | 0.18 | 0.135 |
| 5.249601324148357 | -0.37 | 0.179 | 0.135 |
| 5.252742916801947 | -0.371 | 0.178 | 0.135 |
| 5.255884509455536 | -0.372 | 0.177 | 0.135 |
| 5.259026102109125 | -0.373 | 0.176 | 0.135 |
| 5.262167694762715 | -0.373 | 0.175 | 0.135 |
| 5.265309287416305 | -0.374 | 0.174 | 0.135 |
| 5.268450880069895 | -0.375 | 0.173 | 0.135 |
| 5.271592472723484 | -0.375 | 0.172 | 0.135 |
| 5.274734065377074 | -0.376 | 0.17 | 0.135 |
| 5.277875658030664 | -0.377 | 0.169 | 0.135 |
| 5.281017250684253 | -0.378 | 0.168 | 0.135 |
| 5.284158843337843 | -0.378 | 0.167 | 0.135 |
| 5.287300435991432 | -0.379 | 0.165 | 0.135 |
| 5.290442028645022 | -0.38 | 0.164 | 0.135 |
| 5.293583621298612 | -0.38 | 0.162 | 0.135 |
| 5.296725213952201 | -0.381 | 0.161 | 0.135 |
| 5.299866806605791 | -0.381 | 0.159 | 0.135 |
| 5.30300839925938 | -0.382 | 0.158 | 0.135 |
| 5.30614999191297 | -0.383 | 0.156 | 0.135 |
| 5.30929158456656 | -0.383 | 0.155 | 0.135 |
| 5.312433177220149 | -0.384 | 0.153 | 0.135 |
| 5.315574769873739 | -0.384 | 0.151 | 0.135 |
| 5.318716362527328 | -0.385 | 0.15 | 0.135 |
| 5.321857955180918 | -0.385 | 0.148 | 0.135 |
| 5.324999547834508 | -0.386 | 0.146 | 0.135 |
| 5.328141140488097 | -0.386 | 0.144 | 0.135 |
| 5.331282733141686 | -0.387 | 0.142 | 0.135 |
| 5.334424325795276 | -0.387 | 0.14 | 0.135 |
| 5.337565918448866 | -0.388 | 0.138 | 0.135 |
| 5.340707511102456 | -0.388 | 0.136 | 0.135 |
| 5.343849103756045 | -0.389 | 0.134 | 0.135 |
| 5.346990696409634 | -0.389 | 0.132 | 0.135 |
| 5.350132289063224 | -0.39 | 0.13 | 0.135 |
| 5.353273881716814 | -0.39 | 0.128 | 0.135 |
| 5.356415474370403 | -0.391 | 0.126 | 0.135 |
| 5.359557067023993 | -0.391 | 0.124 | 0.135 |
| 5.362698659677583 | -0.391 | 0.122 | 0.135 |
| 5.365840252331172 | -0.392 | 0.119 | 0.135 |
| 5.368981844984762 | -0.392 | 0.117 | 0.135 |
| 5.372123437638351 | -0.392 | 0.115 | 0.135 |
| 5.375265030291941 | -0.393 | 0.112 | 0.135 |
| 5.378406622945531 | -0.393 | 0.11 | 0.135 |
| 5.38154821559912 | -0.394 | 0.107 | 0.135 |
| 5.38468980825271 | -0.394 | 0.105 | 0.135 |
| 5.387831400906299 | -0.394 | 0.102 | 0.135 |
| 5.39097299355989 | -0.395 | 0.1 | 0.135 |
| 5.394114586213479 | -0.395 | 0.097 | 0.135 |
| 5.397256178867068 | -0.395 | 0.095 | 0.135 |
| 5.400397771520657 | -0.396 | 0.092 | 0.135 |
| 5.403539364174247 | -0.396 | 0.089 | 0.135 |
| 5.406680956827837 | -0.396 | 0.087 | 0.135 |
| 5.409822549481426 | -0.396 | 0.084 | 0.135 |
| 5.412964142135016 | -0.397 | 0.081 | 0.135 |
| 5.416105734788605 | -0.397 | 0.079 | 0.135 |
| 5.419247327442195 | -0.397 | 0.076 | 0.135 |
| 5.422388920095785 | -0.398 | 0.073 | 0.135 |
| 5.425530512749375 | -0.398 | 0.07 | 0.135 |
| 5.428672105402964 | -0.398 | 0.067 | 0.135 |
| 5.431813698056554 | -0.398 | 0.064 | 0.135 |
| 5.434955290710143 | -0.399 | 0.061 | 0.135 |
| 5.438096883363733 | -0.399 | 0.058 | 0.135 |
| 5.441238476017322 | -0.399 | 0.055 | 0.135 |
| 5.444380068670912 | -0.399 | 0.053 | 0.135 |
| 5.447521661324502 | -0.399 | 0.05 | 0.135 |
| 5.450663253978091 | -0.4 | 0.047 | 0.135 |
| 5.453804846631681 | -0.4 | 0.043 | 0.135 |
| 5.456946439285271 | -0.4 | 0.04 | 0.135 |
| 5.46008803193886 | -0.4 | 0.037 | 0.135 |
| 5.46322962459245 | -0.4 | 0.034 | 0.135 |
| 5.466371217246039 | -0.401 | 0.031 | 0.135 |
| 5.46951280989963 | -0.401 | 0.028 | 0.135 |
| 5.472654402553218 | -0.401 | 0.025 | 0.135 |
| 5.475795995206808 | -0.401 | 0.022 | 0.135 |
| 5.478937587860398 | -0.401 | 0.019 | 0.135 |
| 5.482079180513987 | -0.401 | 0.016 | 0.135 |
| 5.485220773167577 | -0.402 | 0.013 | 0.135 |
| 5.488362365821166 | -0.402 | 0.009 | 0.134 |
| 5.491503958474756 | -0.402 | 0.006 | 0.134 |
| 5.494645551128346 | -0.402 | 0.003 | 0.134 |
| 5.497787143781935 | -0.402 | 0 | 0.134 |
| 5.500928736435525 | -0.402 | -0.003 | 0.134 |
| 5.504070329089115 | -0.403 | -0.006 | 0.134 |
| 5.507211921742704 | -0.403 | -0.009 | 0.134 |
| 5.510353514396294 | -0.403 | -0.013 | 0.133 |
| 5.513495107049883 | -0.403 | -0.016 | 0.133 |
| 5.516636699703473 | -0.403 | -0.019 | 0.133 |
| 5.519778292357062 | -0.403 | -0.022 | 0.133 |
| 5.522919885010652 | -0.403 | -0.025 | 0.133 |
| 5.526061477664242 | -0.403 | -0.028 | 0.132 |
| 5.529203070317831 | -0.403 | -0.031 | 0.132 |
| 5.532344662971421 | -0.404 | -0.034 | 0.132 |
| 5.535486255625011 | -0.404 | -0.037 | 0.131 |
| 5.5386278482786 | -0.404 | -0.04 | 0.131 |
| 5.54176944093219 | -0.404 | -0.043 | 0.131 |
| 5.544911033585779 | -0.404 | -0.047 | 0.13 |
| 5.54805262623937 | -0.404 | -0.05 | 0.13 |
| 5.551194218892959 | -0.404 | -0.053 | 0.129 |
| 5.554335811546548 | -0.404 | -0.055 | 0.129 |
| 5.557477404200137 | -0.404 | -0.058 | 0.128 |
| 5.560618996853727 | -0.404 | -0.061 | 0.128 |
| 5.563760589507317 | -0.404 | -0.064 | 0.127 |
| 5.566902182160906 | -0.404 | -0.067 | 0.127 |
| 5.570043774814496 | -0.405 | -0.07 | 0.126 |
| 5.573185367468086 | -0.405 | -0.073 | 0.125 |
| 5.576326960121675 | -0.405 | -0.076 | 0.124 |
| 5.579468552775264 | -0.405 | -0.079 | 0.124 |
| 5.582610145428854 | -0.405 | -0.081 | 0.123 |
| 5.585751738082444 | -0.405 | -0.084 | 0.122 |
| 5.588893330736034 | -0.405 | -0.087 | 0.121 |
| 5.592034923389623 | -0.405 | -0.089 | 0.12 |
| 5.595176516043213 | -0.405 | -0.092 | 0.119 |
| 5.598318108696803 | -0.405 | -0.095 | 0.118 |
| 5.601459701350392 | -0.405 | -0.097 | 0.117 |
| 5.604601294003982 | -0.405 | -0.1 | 0.116 |
| 5.607742886657571 | -0.405 | -0.102 | 0.115 |
| 5.610884479311161 | -0.405 | -0.105 | 0.114 |
| 5.61402607196475 | -0.405 | -0.107 | 0.112 |
| 5.61716766461834 | -0.405 | -0.11 | 0.111 |
| 5.62030925727193 | -0.405 | -0.112 | 0.11 |
| 5.623450849925519 | -0.405 | -0.115 | 0.108 |
| 5.626592442579109 | -0.405 | -0.117 | 0.107 |
| 5.629734035232698 | -0.406 | -0.119 | 0.105 |
| 5.632875627886288 | -0.406 | -0.122 | 0.104 |
| 5.636017220539878 | -0.406 | -0.124 | 0.102 |
| 5.639158813193467 | -0.406 | -0.126 | 0.1 |
| 5.642300405847057 | -0.406 | -0.128 | 0.099 |
| 5.645441998500646 | -0.406 | -0.13 | 0.097 |
| 5.648583591154236 | -0.406 | -0.132 | 0.095 |
| 5.651725183807825 | -0.406 | -0.134 | 0.093 |
| 5.654866776461415 | -0.406 | -0.136 | 0.091 |
| 5.658008369115005 | -0.406 | -0.138 | 0.089 |
| 5.661149961768594 | -0.406 | -0.14 | 0.087 |
| 5.664291554422184 | -0.406 | -0.142 | 0.085 |
| 5.667433147075774 | -0.406 | -0.144 | 0.083 |
| 5.670574739729363 | -0.406 | -0.146 | 0.08 |
| 5.673716332382953 | -0.406 | -0.148 | 0.078 |
| 5.676857925036542 | -0.406 | -0.15 | 0.076 |
| 5.679999517690132 | -0.406 | -0.151 | 0.073 |
| 5.683141110343721 | -0.406 | -0.153 | 0.071 |
| 5.686282702997311 | -0.406 | -0.155 | 0.068 |
| 5.689424295650901 | -0.406 | -0.156 | 0.066 |
| 5.69256588830449 | -0.406 | -0.158 | 0.063 |
| 5.69570748095808 | -0.406 | -0.159 | 0.061 |
| 5.69884907361167 | -0.406 | -0.161 | 0.058 |
| 5.701990666265259 | -0.406 | -0.162 | 0.055 |
| 5.705132258918849 | -0.406 | -0.164 | 0.052 |
| 5.708273851572438 | -0.406 | -0.165 | 0.05 |
| 5.711415444226028 | -0.406 | -0.167 | 0.047 |
| 5.714557036879618 | -0.406 | -0.168 | 0.044 |
| 5.717698629533207 | -0.406 | -0.169 | 0.041 |
| 5.720840222186797 | -0.406 | -0.17 | 0.038 |
| 5.723981814840386 | -0.406 | -0.172 | 0.035 |
| 5.727123407493976 | -0.406 | -0.173 | 0.032 |
| 5.730265000147565 | -0.406 | -0.174 | 0.029 |
| 5.733406592801155 | -0.406 | -0.175 | 0.026 |
| 5.736548185454744 | -0.406 | -0.176 | 0.023 |
| 5.739689778108334 | -0.406 | -0.177 | 0.02 |
| 5.742831370761924 | -0.406 | -0.178 | 0.017 |
| 5.745972963415514 | -0.406 | -0.179 | 0.014 |
| 5.749114556069103 | -0.406 | -0.18 | 0.01 |
| 5.752256148722693 | -0.406 | -0.181 | 0.007 |
| 5.755397741376282 | -0.406 | -0.182 | 0.004 |
| 5.758539334029872 | -0.406 | -0.183 | 0.001 |
| 5.761680926683462 | -0.406 | -0.184 | -0.002 |
| 5.764822519337051 | -0.406 | -0.185 | -0.005 |
| 5.767964111990641 | -0.406 | -0.185 | -0.008 |
| 5.77110570464423 | -0.406 | -0.186 | -0.011 |
| 5.77424729729782 | -0.406 | -0.187 | -0.015 |
| 5.77738888995141 | -0.406 | -0.188 | -0.018 |
| 5.780530482605 | -0.406 | -0.188 | -0.021 |
| 5.783672075258588 | -0.406 | -0.189 | -0.024 |
| 5.786813667912178 | -0.406 | -0.19 | -0.027 |
| 5.789955260565768 | -0.406 | -0.19 | -0.03 |
| 5.793096853219358 | -0.406 | -0.191 | -0.033 |
| 5.796238445872947 | -0.406 | -0.192 | -0.036 |
| 5.799380038526537 | -0.406 | -0.192 | -0.039 |
| 5.802521631180126 | -0.406 | -0.193 | -0.042 |
| 5.805663223833715 | -0.406 | -0.193 | -0.045 |
| 5.808804816487306 | -0.406 | -0.194 | -0.048 |
| 5.811946409140895 | -0.406 | -0.194 | -0.05 |
| 5.815088001794485 | -0.406 | -0.195 | -0.053 |
| 5.818229594448074 | -0.406 | -0.195 | -0.056 |
| 5.821371187101663 | -0.406 | -0.195 | -0.059 |
| 5.824512779755254 | -0.406 | -0.196 | -0.061 |
| 5.827654372408843 | -0.406 | -0.196 | -0.064 |
| 5.830795965062433 | -0.406 | -0.197 | -0.067 |
| 5.833937557716022 | -0.406 | -0.197 | -0.069 |
| 5.837079150369612 | -0.406 | -0.197 | -0.072 |
| 5.840220743023201 | -0.406 | -0.198 | -0.074 |
| 5.843362335676791 | -0.406 | -0.198 | -0.076 |
| 5.846503928330381 | -0.406 | -0.198 | -0.079 |
| 5.84964552098397 | -0.406 | -0.199 | -0.081 |
| 5.85278711363756 | -0.406 | -0.199 | -0.083 |
| 5.85592870629115 | -0.406 | -0.199 | -0.085 |
| 5.85907029894474 | -0.406 | -0.199 | -0.088 |
| 5.862211891598329 | -0.406 | -0.2 | -0.09 |
| 5.865353484251918 | -0.406 | -0.2 | -0.092 |
| 5.868495076905508 | -0.406 | -0.2 | -0.094 |
| 5.871636669559098 | -0.406 | -0.2 | -0.095 |
| 5.874778262212687 | -0.406 | -0.2 | -0.097 |
| 5.877919854866277 | -0.406 | -0.2 | -0.099 |
| 5.881061447519866 | -0.406 | -0.201 | -0.101 |
| 5.884203040173456 | -0.406 | -0.201 | -0.103 |
| 5.887344632827046 | -0.406 | -0.201 | -0.104 |
| 5.890486225480635 | -0.406 | -0.201 | -0.106 |
| 5.893627818134224 | -0.406 | -0.201 | -0.107 |
| 5.896769410787814 | -0.406 | -0.201 | -0.109 |
| 5.899911003441404 | -0.406 | -0.202 | -0.11 |
| 5.903052596094994 | -0.406 | -0.202 | -0.111 |
| 5.906194188748583 | -0.406 | -0.202 | -0.113 |
| 5.909335781402172 | -0.406 | -0.202 | -0.114 |
| 5.912477374055762 | -0.406 | -0.202 | -0.115 |
| 5.915618966709352 | -0.406 | -0.202 | -0.116 |
| 5.918760559362942 | -0.406 | -0.202 | -0.117 |
| 5.921902152016531 | -0.406 | -0.202 | -0.119 |
| 5.92504374467012 | -0.406 | -0.202 | -0.12 |
| 5.92818533732371 | -0.406 | -0.202 | -0.12 |
| 5.9313269299773 | -0.406 | -0.202 | -0.121 |
| 5.93446852263089 | -0.406 | -0.202 | -0.122 |
| 5.93761011528448 | -0.406 | -0.202 | -0.123 |
| 5.940751707938068 | -0.406 | -0.203 | -0.124 |
| 5.943893300591658 | -0.406 | -0.203 | -0.125 |
| 5.947034893245248 | -0.406 | -0.203 | -0.125 |
| 5.950176485898837 | -0.406 | -0.203 | -0.126 |
| 5.953318078552427 | -0.406 | -0.203 | -0.127 |
| 5.956459671206017 | -0.406 | -0.203 | -0.127 |
| 5.959601263859606 | -0.406 | -0.203 | -0.128 |
| 5.962742856513196 | -0.406 | -0.203 | -0.128 |
| 5.965884449166785 | -0.406 | -0.203 | -0.129 |
| 5.969026041820375 | -0.406 | -0.203 | -0.129 |
| 5.972167634473964 | -0.406 | -0.203 | -0.13 |
| 5.975309227127554 | -0.406 | -0.203 | -0.13 |
| 5.978450819781144 | -0.406 | -0.203 | -0.131 |
| 5.981592412434733 | -0.406 | -0.203 | -0.131 |
| 5.984734005088323 | -0.406 | -0.203 | -0.131 |
| 5.987875597741913 | -0.406 | -0.203 | -0.132 |
| 5.991017190395502 | -0.406 | -0.203 | -0.132 |
| 5.994158783049092 | -0.406 | -0.203 | -0.132 |
| 5.997300375702681 | -0.406 | -0.203 | -0.133 |
| 6.000441968356271 | -0.406 | -0.203 | -0.133 |
| 6.003583561009861 | -0.406 | -0.203 | -0.133 |
| 6.00672515366345 | -0.406 | -0.203 | -0.133 |
| 6.00986674631704 | -0.406 | -0.203 | -0.133 |
| 6.01300833897063 | -0.406 | -0.203 | -0.134 |
| 6.01614993162422 | -0.406 | -0.203 | -0.134 |
| 6.019291524277808 | -0.406 | -0.203 | -0.134 |
| 6.022433116931398 | -0.406 | -0.203 | -0.134 |
| 6.025574709584988 | -0.406 | -0.203 | -0.134 |
| 6.028716302238577 | -0.406 | -0.203 | -0.134 |
| 6.031857894892167 | -0.406 | -0.203 | -0.134 |
| 6.034999487545757 | -0.406 | -0.203 | -0.135 |
| 6.038141080199346 | -0.406 | -0.203 | -0.135 |
| 6.041282672852935 | -0.406 | -0.203 | -0.135 |
| 6.044424265506525 | -0.406 | -0.203 | -0.135 |
| 6.047565858160115 | -0.406 | -0.203 | -0.135 |
| 6.050707450813704 | -0.406 | -0.203 | -0.135 |
| 6.053849043467294 | -0.406 | -0.203 | -0.135 |
| 6.056990636120884 | -0.406 | -0.203 | -0.135 |
| 6.060132228774473 | -0.406 | -0.203 | -0.135 |
| 6.063273821428063 | -0.406 | -0.203 | -0.135 |
| 6.066415414081653 | -0.406 | -0.203 | -0.135 |
| 6.069557006735242 | -0.406 | -0.203 | -0.135 |
| 6.072698599388831 | -0.406 | -0.203 | -0.135 |
| 6.07584019204242 | -0.406 | -0.203 | -0.135 |
| 6.078981784696011 | -0.406 | -0.203 | -0.135 |
| 6.082123377349601 | -0.406 | -0.203 | -0.135 |
| 6.08526497000319 | -0.406 | -0.203 | -0.135 |
| 6.08840656265678 | -0.406 | -0.203 | -0.135 |
| 6.09154815531037 | -0.406 | -0.203 | -0.135 |
| 6.094689747963959 | -0.406 | -0.203 | -0.135 |
| 6.097831340617549 | -0.406 | -0.203 | -0.135 |
| 6.100972933271138 | -0.406 | -0.203 | -0.135 |
| 6.104114525924728 | -0.406 | -0.203 | -0.135 |
| 6.107256118578317 | -0.406 | -0.203 | -0.135 |
| 6.110397711231907 | -0.406 | -0.203 | -0.135 |
| 6.113539303885497 | -0.406 | -0.203 | -0.135 |
| 6.116680896539086 | -0.406 | -0.203 | -0.135 |
| 6.119822489192675 | -0.406 | -0.203 | -0.135 |
| 6.122964081846265 | -0.406 | -0.203 | -0.135 |
| 6.126105674499855 | -0.406 | -0.203 | -0.135 |
| 6.129247267153445 | -0.406 | -0.203 | -0.135 |
| 6.132388859807034 | -0.406 | -0.203 | -0.135 |
| 6.135530452460624 | -0.406 | -0.203 | -0.135 |
| 6.138672045114213 | -0.406 | -0.203 | -0.135 |
| 6.141813637767803 | -0.406 | -0.203 | -0.135 |
| 6.144955230421393 | -0.406 | -0.203 | -0.135 |
| 6.148096823074982 | -0.406 | -0.203 | -0.135 |
| 6.151238415728571 | -0.406 | -0.203 | -0.135 |
| 6.154380008382161 | -0.406 | -0.203 | -0.135 |
| 6.157521601035751 | -0.406 | -0.203 | -0.135 |
| 6.16066319368934 | -0.406 | -0.203 | -0.135 |
| 6.16380478634293 | -0.406 | -0.203 | -0.135 |
| 6.16694637899652 | -0.406 | -0.203 | -0.135 |
| 6.170087971650109 | -0.406 | -0.203 | -0.135 |
| 6.173229564303698 | -0.406 | -0.203 | -0.135 |
| 6.176371156957289 | -0.406 | -0.203 | -0.135 |
| 6.179512749610878 | -0.406 | -0.203 | -0.135 |
| 6.182654342264468 | -0.406 | -0.203 | -0.135 |
| 6.185795934918057 | -0.406 | -0.203 | -0.135 |
| 6.188937527571647 | -0.406 | -0.203 | -0.135 |
| 6.192079120225237 | -0.406 | -0.203 | -0.135 |
| 6.195220712878826 | -0.406 | -0.203 | -0.135 |
| 6.198362305532415 | -0.406 | -0.203 | -0.135 |
| 6.201503898186005 | -0.406 | -0.203 | -0.135 |
| 6.204645490839594 | -0.406 | -0.203 | -0.135 |
| 6.207787083493184 | -0.406 | -0.203 | -0.135 |
| 6.210928676146774 | -0.406 | -0.203 | -0.135 |
| 6.214070268800364 | -0.406 | -0.203 | -0.135 |
| 6.217211861453953 | -0.406 | -0.203 | -0.135 |
| 6.220353454107543 | -0.406 | -0.203 | -0.135 |
| 6.223495046761133 | -0.406 | -0.203 | -0.135 |
| 6.226636639414722 | -0.406 | -0.203 | -0.135 |
| 6.229778232068312 | -0.406 | -0.203 | -0.135 |
| 6.232919824721901 | -0.406 | -0.203 | -0.135 |
| 6.236061417375491 | -0.406 | -0.203 | -0.135 |
| 6.23920301002908 | -0.406 | -0.203 | -0.135 |
| 6.24234460268267 | -0.406 | -0.203 | -0.135 |
| 6.24548619533626 | -0.406 | -0.203 | -0.135 |
| 6.24862778798985 | -0.406 | -0.203 | -0.135 |
| 6.251769380643438 | -0.406 | -0.203 | -0.135 |
| 6.254910973297028 | -0.406 | -0.203 | -0.135 |
| 6.258052565950618 | -0.406 | -0.203 | -0.135 |
| 6.261194158604208 | -0.406 | -0.203 | -0.135 |
| 6.264335751257797 | -0.406 | -0.203 | -0.135 |
| 6.267477343911387 | -0.406 | -0.203 | -0.135 |
| 6.270618936564976 | -0.406 | -0.203 | -0.135 |
| 6.273760529218566 | -0.406 | -0.203 | -0.135 |
| 6.276902121872155 | -0.406 | -0.203 | -0.135 |
| 6.280043714525745 | -0.406 | -0.203 | -0.135 |
| 6.283185307179335 | -0.406 | -0.203 | -0.135 |